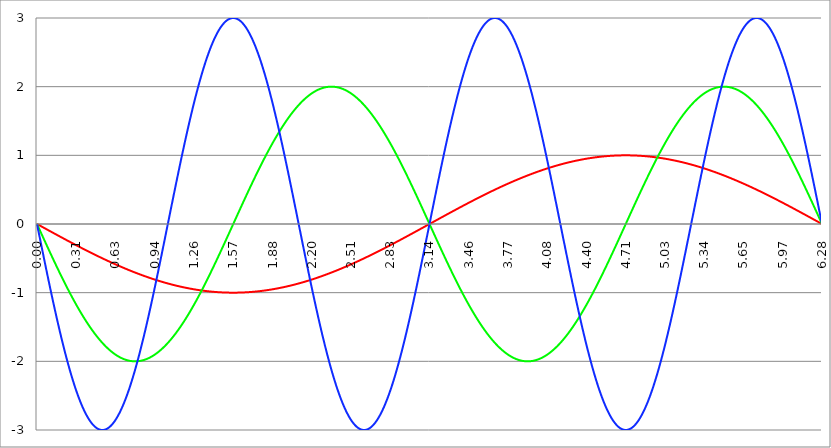
| Category | Series 1 | Series 0 | Series 2 |
|---|---|---|---|
| 0.0 | 0 | 0 | 0 |
| 0.00314159265358979 | -0.003 | -0.013 | -0.028 |
| 0.00628318530717958 | -0.006 | -0.025 | -0.057 |
| 0.00942477796076938 | -0.009 | -0.038 | -0.085 |
| 0.0125663706143592 | -0.013 | -0.05 | -0.113 |
| 0.015707963267949 | -0.016 | -0.063 | -0.141 |
| 0.0188495559215388 | -0.019 | -0.075 | -0.17 |
| 0.0219911485751285 | -0.022 | -0.088 | -0.198 |
| 0.0251327412287183 | -0.025 | -0.1 | -0.226 |
| 0.0282743338823081 | -0.028 | -0.113 | -0.254 |
| 0.0314159265358979 | -0.031 | -0.126 | -0.282 |
| 0.0345575191894877 | -0.035 | -0.138 | -0.31 |
| 0.0376991118430775 | -0.038 | -0.151 | -0.339 |
| 0.0408407044966673 | -0.041 | -0.163 | -0.367 |
| 0.0439822971502571 | -0.044 | -0.176 | -0.395 |
| 0.0471238898038469 | -0.047 | -0.188 | -0.423 |
| 0.0502654824574367 | -0.05 | -0.201 | -0.451 |
| 0.0534070751110265 | -0.053 | -0.213 | -0.479 |
| 0.0565486677646163 | -0.057 | -0.226 | -0.507 |
| 0.059690260418206 | -0.06 | -0.238 | -0.534 |
| 0.0628318530717958 | -0.063 | -0.251 | -0.562 |
| 0.0659734457253856 | -0.066 | -0.263 | -0.59 |
| 0.0691150383789754 | -0.069 | -0.276 | -0.618 |
| 0.0722566310325652 | -0.072 | -0.288 | -0.645 |
| 0.075398223686155 | -0.075 | -0.3 | -0.673 |
| 0.0785398163397448 | -0.078 | -0.313 | -0.7 |
| 0.0816814089933346 | -0.082 | -0.325 | -0.728 |
| 0.0848230016469244 | -0.085 | -0.338 | -0.755 |
| 0.0879645943005142 | -0.088 | -0.35 | -0.783 |
| 0.091106186954104 | -0.091 | -0.362 | -0.81 |
| 0.0942477796076937 | -0.094 | -0.375 | -0.837 |
| 0.0973893722612835 | -0.097 | -0.387 | -0.864 |
| 0.100530964914873 | -0.1 | -0.399 | -0.891 |
| 0.103672557568463 | -0.103 | -0.412 | -0.918 |
| 0.106814150222053 | -0.107 | -0.424 | -0.945 |
| 0.109955742875643 | -0.11 | -0.436 | -0.972 |
| 0.113097335529233 | -0.113 | -0.449 | -0.998 |
| 0.116238928182822 | -0.116 | -0.461 | -1.025 |
| 0.119380520836412 | -0.119 | -0.473 | -1.052 |
| 0.122522113490002 | -0.122 | -0.485 | -1.078 |
| 0.125663706143592 | -0.125 | -0.497 | -1.104 |
| 0.128805298797181 | -0.128 | -0.51 | -1.131 |
| 0.131946891450771 | -0.132 | -0.522 | -1.157 |
| 0.135088484104361 | -0.135 | -0.534 | -1.183 |
| 0.138230076757951 | -0.138 | -0.546 | -1.209 |
| 0.141371669411541 | -0.141 | -0.558 | -1.235 |
| 0.14451326206513 | -0.144 | -0.57 | -1.26 |
| 0.14765485471872 | -0.147 | -0.582 | -1.286 |
| 0.15079644737231 | -0.15 | -0.594 | -1.311 |
| 0.1539380400259 | -0.153 | -0.606 | -1.337 |
| 0.15707963267949 | -0.156 | -0.618 | -1.362 |
| 0.160221225333079 | -0.16 | -0.63 | -1.387 |
| 0.163362817986669 | -0.163 | -0.642 | -1.412 |
| 0.166504410640259 | -0.166 | -0.654 | -1.437 |
| 0.169646003293849 | -0.169 | -0.666 | -1.462 |
| 0.172787595947439 | -0.172 | -0.677 | -1.486 |
| 0.175929188601028 | -0.175 | -0.689 | -1.511 |
| 0.179070781254618 | -0.178 | -0.701 | -1.535 |
| 0.182212373908208 | -0.181 | -0.713 | -1.559 |
| 0.185353966561798 | -0.184 | -0.725 | -1.584 |
| 0.188495559215388 | -0.187 | -0.736 | -1.607 |
| 0.191637151868977 | -0.19 | -0.748 | -1.631 |
| 0.194778744522567 | -0.194 | -0.76 | -1.655 |
| 0.197920337176157 | -0.197 | -0.771 | -1.678 |
| 0.201061929829747 | -0.2 | -0.783 | -1.702 |
| 0.204203522483336 | -0.203 | -0.794 | -1.725 |
| 0.207345115136926 | -0.206 | -0.806 | -1.748 |
| 0.210486707790516 | -0.209 | -0.817 | -1.771 |
| 0.213628300444106 | -0.212 | -0.829 | -1.794 |
| 0.216769893097696 | -0.215 | -0.84 | -1.816 |
| 0.219911485751285 | -0.218 | -0.852 | -1.839 |
| 0.223053078404875 | -0.221 | -0.863 | -1.861 |
| 0.226194671058465 | -0.224 | -0.874 | -1.883 |
| 0.229336263712055 | -0.227 | -0.886 | -1.905 |
| 0.232477856365645 | -0.23 | -0.897 | -1.927 |
| 0.235619449019234 | -0.233 | -0.908 | -1.948 |
| 0.238761041672824 | -0.236 | -0.919 | -1.97 |
| 0.241902634326414 | -0.24 | -0.93 | -1.991 |
| 0.245044226980004 | -0.243 | -0.941 | -2.012 |
| 0.248185819633594 | -0.246 | -0.952 | -2.033 |
| 0.251327412287183 | -0.249 | -0.964 | -2.054 |
| 0.254469004940773 | -0.252 | -0.975 | -2.074 |
| 0.257610597594363 | -0.255 | -0.985 | -2.094 |
| 0.260752190247953 | -0.258 | -0.996 | -2.115 |
| 0.263893782901543 | -0.261 | -1.007 | -2.135 |
| 0.267035375555132 | -0.264 | -1.018 | -2.154 |
| 0.270176968208722 | -0.267 | -1.029 | -2.174 |
| 0.273318560862312 | -0.27 | -1.04 | -2.193 |
| 0.276460153515902 | -0.273 | -1.05 | -2.213 |
| 0.279601746169492 | -0.276 | -1.061 | -2.232 |
| 0.282743338823082 | -0.279 | -1.072 | -2.25 |
| 0.285884931476671 | -0.282 | -1.082 | -2.269 |
| 0.289026524130261 | -0.285 | -1.093 | -2.287 |
| 0.292168116783851 | -0.288 | -1.103 | -2.306 |
| 0.295309709437441 | -0.291 | -1.114 | -2.324 |
| 0.298451302091031 | -0.294 | -1.124 | -2.341 |
| 0.30159289474462 | -0.297 | -1.135 | -2.359 |
| 0.30473448739821 | -0.3 | -1.145 | -2.376 |
| 0.3078760800518 | -0.303 | -1.155 | -2.393 |
| 0.31101767270539 | -0.306 | -1.165 | -2.41 |
| 0.31415926535898 | -0.309 | -1.176 | -2.427 |
| 0.31730085801257 | -0.312 | -1.186 | -2.444 |
| 0.320442450666159 | -0.315 | -1.196 | -2.46 |
| 0.323584043319749 | -0.318 | -1.206 | -2.476 |
| 0.326725635973339 | -0.321 | -1.216 | -2.492 |
| 0.329867228626929 | -0.324 | -1.226 | -2.507 |
| 0.333008821280519 | -0.327 | -1.236 | -2.523 |
| 0.336150413934108 | -0.33 | -1.246 | -2.538 |
| 0.339292006587698 | -0.333 | -1.255 | -2.553 |
| 0.342433599241288 | -0.336 | -1.265 | -2.568 |
| 0.345575191894878 | -0.339 | -1.275 | -2.582 |
| 0.348716784548468 | -0.342 | -1.285 | -2.597 |
| 0.351858377202058 | -0.345 | -1.294 | -2.611 |
| 0.354999969855647 | -0.348 | -1.304 | -2.624 |
| 0.358141562509237 | -0.351 | -1.313 | -2.638 |
| 0.361283155162827 | -0.353 | -1.323 | -2.651 |
| 0.364424747816417 | -0.356 | -1.332 | -2.664 |
| 0.367566340470007 | -0.359 | -1.341 | -2.677 |
| 0.370707933123597 | -0.362 | -1.351 | -2.69 |
| 0.373849525777186 | -0.365 | -1.36 | -2.702 |
| 0.376991118430776 | -0.368 | -1.369 | -2.714 |
| 0.380132711084366 | -0.371 | -1.378 | -2.726 |
| 0.383274303737956 | -0.374 | -1.387 | -2.738 |
| 0.386415896391546 | -0.377 | -1.396 | -2.75 |
| 0.389557489045135 | -0.38 | -1.405 | -2.761 |
| 0.392699081698725 | -0.383 | -1.414 | -2.772 |
| 0.395840674352315 | -0.386 | -1.423 | -2.782 |
| 0.398982267005905 | -0.388 | -1.432 | -2.793 |
| 0.402123859659495 | -0.391 | -1.441 | -2.803 |
| 0.405265452313085 | -0.394 | -1.449 | -2.813 |
| 0.408407044966674 | -0.397 | -1.458 | -2.823 |
| 0.411548637620264 | -0.4 | -1.467 | -2.832 |
| 0.414690230273854 | -0.403 | -1.475 | -2.841 |
| 0.417831822927444 | -0.406 | -1.483 | -2.85 |
| 0.420973415581034 | -0.409 | -1.492 | -2.859 |
| 0.424115008234623 | -0.412 | -1.5 | -2.867 |
| 0.427256600888213 | -0.414 | -1.509 | -2.876 |
| 0.430398193541803 | -0.417 | -1.517 | -2.883 |
| 0.433539786195393 | -0.42 | -1.525 | -2.891 |
| 0.436681378848983 | -0.423 | -1.533 | -2.899 |
| 0.439822971502573 | -0.426 | -1.541 | -2.906 |
| 0.442964564156162 | -0.429 | -1.549 | -2.913 |
| 0.446106156809752 | -0.431 | -1.557 | -2.919 |
| 0.449247749463342 | -0.434 | -1.565 | -2.926 |
| 0.452389342116932 | -0.437 | -1.573 | -2.932 |
| 0.455530934770522 | -0.44 | -1.58 | -2.938 |
| 0.458672527424111 | -0.443 | -1.588 | -2.943 |
| 0.461814120077701 | -0.446 | -1.596 | -2.949 |
| 0.464955712731291 | -0.448 | -1.603 | -2.954 |
| 0.468097305384881 | -0.451 | -1.611 | -2.959 |
| 0.471238898038471 | -0.454 | -1.618 | -2.963 |
| 0.474380490692061 | -0.457 | -1.625 | -2.967 |
| 0.47752208334565 | -0.46 | -1.633 | -2.971 |
| 0.48066367599924 | -0.462 | -1.64 | -2.975 |
| 0.48380526865283 | -0.465 | -1.647 | -2.979 |
| 0.48694686130642 | -0.468 | -1.654 | -2.982 |
| 0.49008845396001 | -0.471 | -1.661 | -2.985 |
| 0.493230046613599 | -0.473 | -1.668 | -2.988 |
| 0.496371639267189 | -0.476 | -1.675 | -2.99 |
| 0.499513231920779 | -0.479 | -1.682 | -2.992 |
| 0.502654824574369 | -0.482 | -1.689 | -2.994 |
| 0.505796417227959 | -0.485 | -1.695 | -2.996 |
| 0.508938009881549 | -0.487 | -1.702 | -2.997 |
| 0.512079602535138 | -0.49 | -1.709 | -2.998 |
| 0.515221195188728 | -0.493 | -1.715 | -2.999 |
| 0.518362787842318 | -0.495 | -1.721 | -3 |
| 0.521504380495908 | -0.498 | -1.728 | -3 |
| 0.524645973149498 | -0.501 | -1.734 | -3 |
| 0.527787565803087 | -0.504 | -1.74 | -3 |
| 0.530929158456677 | -0.506 | -1.747 | -2.999 |
| 0.534070751110267 | -0.509 | -1.753 | -2.999 |
| 0.537212343763857 | -0.512 | -1.759 | -2.997 |
| 0.540353936417447 | -0.514 | -1.765 | -2.996 |
| 0.543495529071037 | -0.517 | -1.77 | -2.995 |
| 0.546637121724626 | -0.52 | -1.776 | -2.993 |
| 0.549778714378216 | -0.522 | -1.782 | -2.991 |
| 0.552920307031806 | -0.525 | -1.788 | -2.988 |
| 0.556061899685396 | -0.528 | -1.793 | -2.986 |
| 0.559203492338986 | -0.531 | -1.799 | -2.983 |
| 0.562345084992576 | -0.533 | -1.804 | -2.98 |
| 0.565486677646165 | -0.536 | -1.81 | -2.976 |
| 0.568628270299755 | -0.538 | -1.815 | -2.973 |
| 0.571769862953345 | -0.541 | -1.82 | -2.969 |
| 0.574911455606935 | -0.544 | -1.825 | -2.965 |
| 0.578053048260525 | -0.546 | -1.83 | -2.96 |
| 0.581194640914114 | -0.549 | -1.836 | -2.955 |
| 0.584336233567704 | -0.552 | -1.84 | -2.95 |
| 0.587477826221294 | -0.554 | -1.845 | -2.945 |
| 0.590619418874884 | -0.557 | -1.85 | -2.94 |
| 0.593761011528474 | -0.559 | -1.855 | -2.934 |
| 0.596902604182064 | -0.562 | -1.86 | -2.928 |
| 0.600044196835653 | -0.565 | -1.864 | -2.921 |
| 0.603185789489243 | -0.567 | -1.869 | -2.915 |
| 0.606327382142833 | -0.57 | -1.873 | -2.908 |
| 0.609468974796423 | -0.572 | -1.877 | -2.901 |
| 0.612610567450013 | -0.575 | -1.882 | -2.894 |
| 0.615752160103602 | -0.578 | -1.886 | -2.886 |
| 0.618893752757192 | -0.58 | -1.89 | -2.878 |
| 0.622035345410782 | -0.583 | -1.894 | -2.87 |
| 0.625176938064372 | -0.585 | -1.898 | -2.862 |
| 0.628318530717962 | -0.588 | -1.902 | -2.853 |
| 0.631460123371551 | -0.59 | -1.906 | -2.844 |
| 0.634601716025141 | -0.593 | -1.91 | -2.835 |
| 0.637743308678731 | -0.595 | -1.913 | -2.826 |
| 0.640884901332321 | -0.598 | -1.917 | -2.816 |
| 0.644026493985911 | -0.6 | -1.921 | -2.806 |
| 0.647168086639501 | -0.603 | -1.924 | -2.796 |
| 0.65030967929309 | -0.605 | -1.927 | -2.786 |
| 0.65345127194668 | -0.608 | -1.931 | -2.775 |
| 0.65659286460027 | -0.61 | -1.934 | -2.764 |
| 0.65973445725386 | -0.613 | -1.937 | -2.753 |
| 0.66287604990745 | -0.615 | -1.94 | -2.742 |
| 0.666017642561039 | -0.618 | -1.943 | -2.73 |
| 0.669159235214629 | -0.62 | -1.946 | -2.718 |
| 0.672300827868219 | -0.623 | -1.949 | -2.706 |
| 0.675442420521809 | -0.625 | -1.952 | -2.694 |
| 0.678584013175399 | -0.628 | -1.955 | -2.682 |
| 0.681725605828989 | -0.63 | -1.957 | -2.669 |
| 0.684867198482578 | -0.633 | -1.96 | -2.656 |
| 0.688008791136168 | -0.635 | -1.962 | -2.642 |
| 0.691150383789758 | -0.637 | -1.965 | -2.629 |
| 0.694291976443348 | -0.64 | -1.967 | -2.615 |
| 0.697433569096938 | -0.642 | -1.969 | -2.601 |
| 0.700575161750528 | -0.645 | -1.971 | -2.587 |
| 0.703716754404117 | -0.647 | -1.973 | -2.573 |
| 0.706858347057707 | -0.649 | -1.975 | -2.558 |
| 0.709999939711297 | -0.652 | -1.977 | -2.543 |
| 0.713141532364887 | -0.654 | -1.979 | -2.528 |
| 0.716283125018477 | -0.657 | -1.981 | -2.513 |
| 0.719424717672066 | -0.659 | -1.983 | -2.497 |
| 0.722566310325656 | -0.661 | -1.984 | -2.481 |
| 0.725707902979246 | -0.664 | -1.986 | -2.465 |
| 0.728849495632836 | -0.666 | -1.987 | -2.449 |
| 0.731991088286426 | -0.668 | -1.989 | -2.433 |
| 0.735132680940016 | -0.671 | -1.99 | -2.416 |
| 0.738274273593605 | -0.673 | -1.991 | -2.399 |
| 0.741415866247195 | -0.675 | -1.992 | -2.382 |
| 0.744557458900785 | -0.678 | -1.993 | -2.365 |
| 0.747699051554375 | -0.68 | -1.994 | -2.347 |
| 0.750840644207965 | -0.682 | -1.995 | -2.329 |
| 0.753982236861554 | -0.685 | -1.996 | -2.312 |
| 0.757123829515144 | -0.687 | -1.997 | -2.293 |
| 0.760265422168734 | -0.689 | -1.997 | -2.275 |
| 0.763407014822324 | -0.691 | -1.998 | -2.257 |
| 0.766548607475914 | -0.694 | -1.999 | -2.238 |
| 0.769690200129504 | -0.696 | -1.999 | -2.219 |
| 0.772831792783093 | -0.698 | -1.999 | -2.2 |
| 0.775973385436683 | -0.7 | -2 | -2.18 |
| 0.779114978090273 | -0.703 | -2 | -2.161 |
| 0.782256570743863 | -0.705 | -2 | -2.141 |
| 0.785398163397453 | -0.707 | -2 | -2.121 |
| 0.788539756051042 | -0.709 | -2 | -2.101 |
| 0.791681348704632 | -0.712 | -2 | -2.081 |
| 0.794822941358222 | -0.714 | -2 | -2.061 |
| 0.797964534011812 | -0.716 | -1.999 | -2.04 |
| 0.801106126665402 | -0.718 | -1.999 | -2.019 |
| 0.804247719318992 | -0.72 | -1.999 | -1.998 |
| 0.807389311972581 | -0.722 | -1.998 | -1.977 |
| 0.810530904626171 | -0.725 | -1.997 | -1.956 |
| 0.813672497279761 | -0.727 | -1.997 | -1.934 |
| 0.816814089933351 | -0.729 | -1.996 | -1.912 |
| 0.819955682586941 | -0.731 | -1.995 | -1.89 |
| 0.823097275240531 | -0.733 | -1.994 | -1.868 |
| 0.82623886789412 | -0.735 | -1.993 | -1.846 |
| 0.82938046054771 | -0.738 | -1.992 | -1.824 |
| 0.8325220532013 | -0.74 | -1.991 | -1.801 |
| 0.83566364585489 | -0.742 | -1.99 | -1.779 |
| 0.83880523850848 | -0.744 | -1.989 | -1.756 |
| 0.841946831162069 | -0.746 | -1.987 | -1.733 |
| 0.845088423815659 | -0.748 | -1.986 | -1.71 |
| 0.848230016469249 | -0.75 | -1.984 | -1.686 |
| 0.851371609122839 | -0.752 | -1.983 | -1.663 |
| 0.854513201776429 | -0.754 | -1.981 | -1.639 |
| 0.857654794430019 | -0.756 | -1.979 | -1.615 |
| 0.860796387083608 | -0.758 | -1.977 | -1.592 |
| 0.863937979737198 | -0.76 | -1.975 | -1.567 |
| 0.867079572390788 | -0.762 | -1.973 | -1.543 |
| 0.870221165044378 | -0.764 | -1.971 | -1.519 |
| 0.873362757697968 | -0.766 | -1.969 | -1.495 |
| 0.876504350351557 | -0.769 | -1.967 | -1.47 |
| 0.879645943005147 | -0.771 | -1.965 | -1.445 |
| 0.882787535658737 | -0.773 | -1.962 | -1.42 |
| 0.885929128312327 | -0.775 | -1.96 | -1.395 |
| 0.889070720965917 | -0.776 | -1.957 | -1.37 |
| 0.892212313619507 | -0.778 | -1.955 | -1.345 |
| 0.895353906273096 | -0.78 | -1.952 | -1.32 |
| 0.898495498926686 | -0.782 | -1.949 | -1.294 |
| 0.901637091580276 | -0.784 | -1.946 | -1.269 |
| 0.904778684233866 | -0.786 | -1.943 | -1.243 |
| 0.907920276887456 | -0.788 | -1.94 | -1.217 |
| 0.911061869541045 | -0.79 | -1.937 | -1.191 |
| 0.914203462194635 | -0.792 | -1.934 | -1.165 |
| 0.917345054848225 | -0.794 | -1.931 | -1.139 |
| 0.920486647501815 | -0.796 | -1.927 | -1.113 |
| 0.923628240155405 | -0.798 | -1.924 | -1.087 |
| 0.926769832808995 | -0.8 | -1.921 | -1.06 |
| 0.929911425462584 | -0.802 | -1.917 | -1.034 |
| 0.933053018116174 | -0.803 | -1.913 | -1.007 |
| 0.936194610769764 | -0.805 | -1.91 | -0.981 |
| 0.939336203423354 | -0.807 | -1.906 | -0.954 |
| 0.942477796076944 | -0.809 | -1.902 | -0.927 |
| 0.945619388730533 | -0.811 | -1.898 | -0.9 |
| 0.948760981384123 | -0.813 | -1.894 | -0.873 |
| 0.951902574037713 | -0.815 | -1.89 | -0.846 |
| 0.955044166691303 | -0.816 | -1.886 | -0.819 |
| 0.958185759344893 | -0.818 | -1.882 | -0.792 |
| 0.961327351998483 | -0.82 | -1.877 | -0.764 |
| 0.964468944652072 | -0.822 | -1.873 | -0.737 |
| 0.967610537305662 | -0.824 | -1.869 | -0.709 |
| 0.970752129959252 | -0.825 | -1.864 | -0.682 |
| 0.973893722612842 | -0.827 | -1.86 | -0.654 |
| 0.977035315266432 | -0.829 | -1.855 | -0.627 |
| 0.980176907920022 | -0.831 | -1.85 | -0.599 |
| 0.983318500573611 | -0.832 | -1.845 | -0.571 |
| 0.986460093227201 | -0.834 | -1.84 | -0.544 |
| 0.989601685880791 | -0.836 | -1.836 | -0.516 |
| 0.992743278534381 | -0.838 | -1.83 | -0.488 |
| 0.995884871187971 | -0.839 | -1.825 | -0.46 |
| 0.99902646384156 | -0.841 | -1.82 | -0.432 |
| 1.00216805649515 | -0.843 | -1.815 | -0.404 |
| 1.00530964914874 | -0.844 | -1.81 | -0.376 |
| 1.00845124180233 | -0.846 | -1.804 | -0.348 |
| 1.01159283445592 | -0.848 | -1.799 | -0.32 |
| 1.01473442710951 | -0.849 | -1.793 | -0.292 |
| 1.017876019763099 | -0.851 | -1.788 | -0.264 |
| 1.021017612416689 | -0.853 | -1.782 | -0.235 |
| 1.02415920507028 | -0.854 | -1.776 | -0.207 |
| 1.027300797723869 | -0.856 | -1.77 | -0.179 |
| 1.030442390377459 | -0.858 | -1.765 | -0.151 |
| 1.033583983031048 | -0.859 | -1.759 | -0.122 |
| 1.036725575684638 | -0.861 | -1.753 | -0.094 |
| 1.039867168338228 | -0.862 | -1.747 | -0.066 |
| 1.043008760991818 | -0.864 | -1.74 | -0.038 |
| 1.046150353645408 | -0.866 | -1.734 | -0.009 |
| 1.049291946298998 | -0.867 | -1.728 | 0.019 |
| 1.052433538952587 | -0.869 | -1.721 | 0.047 |
| 1.055575131606177 | -0.87 | -1.715 | 0.075 |
| 1.058716724259767 | -0.872 | -1.709 | 0.104 |
| 1.061858316913357 | -0.873 | -1.702 | 0.132 |
| 1.064999909566947 | -0.875 | -1.695 | 0.16 |
| 1.068141502220536 | -0.876 | -1.689 | 0.188 |
| 1.071283094874126 | -0.878 | -1.682 | 0.217 |
| 1.074424687527716 | -0.879 | -1.675 | 0.245 |
| 1.077566280181306 | -0.881 | -1.668 | 0.273 |
| 1.080707872834896 | -0.882 | -1.661 | 0.301 |
| 1.083849465488486 | -0.884 | -1.654 | 0.329 |
| 1.086991058142075 | -0.885 | -1.647 | 0.357 |
| 1.090132650795665 | -0.887 | -1.64 | 0.385 |
| 1.093274243449255 | -0.888 | -1.633 | 0.413 |
| 1.096415836102845 | -0.89 | -1.625 | 0.441 |
| 1.099557428756435 | -0.891 | -1.618 | 0.469 |
| 1.102699021410025 | -0.892 | -1.611 | 0.497 |
| 1.105840614063614 | -0.894 | -1.603 | 0.525 |
| 1.108982206717204 | -0.895 | -1.596 | 0.553 |
| 1.112123799370794 | -0.897 | -1.588 | 0.581 |
| 1.115265392024384 | -0.898 | -1.58 | 0.608 |
| 1.118406984677974 | -0.899 | -1.573 | 0.636 |
| 1.121548577331563 | -0.901 | -1.565 | 0.664 |
| 1.124690169985153 | -0.902 | -1.557 | 0.691 |
| 1.127831762638743 | -0.903 | -1.549 | 0.719 |
| 1.130973355292333 | -0.905 | -1.541 | 0.746 |
| 1.134114947945923 | -0.906 | -1.533 | 0.773 |
| 1.137256540599513 | -0.907 | -1.525 | 0.801 |
| 1.140398133253102 | -0.909 | -1.517 | 0.828 |
| 1.143539725906692 | -0.91 | -1.509 | 0.855 |
| 1.146681318560282 | -0.911 | -1.5 | 0.882 |
| 1.149822911213872 | -0.913 | -1.492 | 0.909 |
| 1.152964503867462 | -0.914 | -1.483 | 0.936 |
| 1.156106096521051 | -0.915 | -1.475 | 0.963 |
| 1.159247689174641 | -0.917 | -1.467 | 0.99 |
| 1.162389281828231 | -0.918 | -1.458 | 1.016 |
| 1.165530874481821 | -0.919 | -1.449 | 1.043 |
| 1.168672467135411 | -0.92 | -1.441 | 1.069 |
| 1.171814059789001 | -0.921 | -1.432 | 1.096 |
| 1.17495565244259 | -0.923 | -1.423 | 1.122 |
| 1.17809724509618 | -0.924 | -1.414 | 1.148 |
| 1.18123883774977 | -0.925 | -1.405 | 1.174 |
| 1.18438043040336 | -0.926 | -1.396 | 1.2 |
| 1.18752202305695 | -0.927 | -1.387 | 1.226 |
| 1.190663615710539 | -0.929 | -1.378 | 1.252 |
| 1.193805208364129 | -0.93 | -1.369 | 1.277 |
| 1.19694680101772 | -0.931 | -1.36 | 1.303 |
| 1.200088393671309 | -0.932 | -1.351 | 1.328 |
| 1.203229986324899 | -0.933 | -1.341 | 1.354 |
| 1.206371578978489 | -0.934 | -1.332 | 1.379 |
| 1.209513171632078 | -0.935 | -1.323 | 1.404 |
| 1.212654764285668 | -0.937 | -1.313 | 1.429 |
| 1.215796356939258 | -0.938 | -1.304 | 1.454 |
| 1.218937949592848 | -0.939 | -1.294 | 1.478 |
| 1.222079542246438 | -0.94 | -1.285 | 1.503 |
| 1.225221134900027 | -0.941 | -1.275 | 1.527 |
| 1.228362727553617 | -0.942 | -1.265 | 1.551 |
| 1.231504320207207 | -0.943 | -1.255 | 1.576 |
| 1.234645912860797 | -0.944 | -1.246 | 1.6 |
| 1.237787505514387 | -0.945 | -1.236 | 1.623 |
| 1.240929098167977 | -0.946 | -1.226 | 1.647 |
| 1.244070690821566 | -0.947 | -1.216 | 1.671 |
| 1.247212283475156 | -0.948 | -1.206 | 1.694 |
| 1.250353876128746 | -0.949 | -1.196 | 1.717 |
| 1.253495468782336 | -0.95 | -1.186 | 1.74 |
| 1.256637061435926 | -0.951 | -1.176 | 1.763 |
| 1.259778654089515 | -0.952 | -1.165 | 1.786 |
| 1.262920246743105 | -0.953 | -1.155 | 1.809 |
| 1.266061839396695 | -0.954 | -1.145 | 1.831 |
| 1.269203432050285 | -0.955 | -1.135 | 1.854 |
| 1.272345024703875 | -0.956 | -1.124 | 1.876 |
| 1.275486617357465 | -0.957 | -1.114 | 1.898 |
| 1.278628210011054 | -0.958 | -1.103 | 1.92 |
| 1.281769802664644 | -0.959 | -1.093 | 1.941 |
| 1.284911395318234 | -0.959 | -1.082 | 1.963 |
| 1.288052987971824 | -0.96 | -1.072 | 1.984 |
| 1.291194580625414 | -0.961 | -1.061 | 2.005 |
| 1.294336173279003 | -0.962 | -1.05 | 2.026 |
| 1.297477765932593 | -0.963 | -1.04 | 2.047 |
| 1.300619358586183 | -0.964 | -1.029 | 2.067 |
| 1.303760951239773 | -0.965 | -1.018 | 2.088 |
| 1.306902543893363 | -0.965 | -1.007 | 2.108 |
| 1.310044136546953 | -0.966 | -0.996 | 2.128 |
| 1.313185729200542 | -0.967 | -0.985 | 2.148 |
| 1.316327321854132 | -0.968 | -0.975 | 2.167 |
| 1.319468914507722 | -0.969 | -0.964 | 2.187 |
| 1.322610507161312 | -0.969 | -0.952 | 2.206 |
| 1.325752099814902 | -0.97 | -0.941 | 2.225 |
| 1.328893692468491 | -0.971 | -0.93 | 2.244 |
| 1.332035285122081 | -0.972 | -0.919 | 2.263 |
| 1.335176877775671 | -0.972 | -0.908 | 2.281 |
| 1.338318470429261 | -0.973 | -0.897 | 2.299 |
| 1.341460063082851 | -0.974 | -0.886 | 2.318 |
| 1.344601655736441 | -0.975 | -0.874 | 2.335 |
| 1.34774324839003 | -0.975 | -0.863 | 2.353 |
| 1.35088484104362 | -0.976 | -0.852 | 2.37 |
| 1.35402643369721 | -0.977 | -0.84 | 2.388 |
| 1.3571680263508 | -0.977 | -0.829 | 2.405 |
| 1.36030961900439 | -0.978 | -0.817 | 2.421 |
| 1.363451211657979 | -0.979 | -0.806 | 2.438 |
| 1.36659280431157 | -0.979 | -0.794 | 2.454 |
| 1.369734396965159 | -0.98 | -0.783 | 2.471 |
| 1.372875989618749 | -0.98 | -0.771 | 2.487 |
| 1.376017582272339 | -0.981 | -0.76 | 2.502 |
| 1.379159174925929 | -0.982 | -0.748 | 2.518 |
| 1.382300767579518 | -0.982 | -0.736 | 2.533 |
| 1.385442360233108 | -0.983 | -0.725 | 2.548 |
| 1.388583952886698 | -0.983 | -0.713 | 2.563 |
| 1.391725545540288 | -0.984 | -0.701 | 2.577 |
| 1.394867138193878 | -0.985 | -0.689 | 2.592 |
| 1.398008730847468 | -0.985 | -0.677 | 2.606 |
| 1.401150323501057 | -0.986 | -0.666 | 2.62 |
| 1.404291916154647 | -0.986 | -0.654 | 2.633 |
| 1.407433508808237 | -0.987 | -0.642 | 2.647 |
| 1.410575101461827 | -0.987 | -0.63 | 2.66 |
| 1.413716694115417 | -0.988 | -0.618 | 2.673 |
| 1.416858286769006 | -0.988 | -0.606 | 2.686 |
| 1.419999879422596 | -0.989 | -0.594 | 2.698 |
| 1.423141472076186 | -0.989 | -0.582 | 2.71 |
| 1.426283064729776 | -0.99 | -0.57 | 2.722 |
| 1.429424657383366 | -0.99 | -0.558 | 2.734 |
| 1.432566250036956 | -0.99 | -0.546 | 2.746 |
| 1.435707842690545 | -0.991 | -0.534 | 2.757 |
| 1.438849435344135 | -0.991 | -0.522 | 2.768 |
| 1.441991027997725 | -0.992 | -0.51 | 2.779 |
| 1.445132620651315 | -0.992 | -0.497 | 2.789 |
| 1.448274213304905 | -0.993 | -0.485 | 2.8 |
| 1.451415805958494 | -0.993 | -0.473 | 2.81 |
| 1.454557398612084 | -0.993 | -0.461 | 2.819 |
| 1.457698991265674 | -0.994 | -0.449 | 2.829 |
| 1.460840583919264 | -0.994 | -0.436 | 2.838 |
| 1.463982176572854 | -0.994 | -0.424 | 2.847 |
| 1.467123769226444 | -0.995 | -0.412 | 2.856 |
| 1.470265361880033 | -0.995 | -0.399 | 2.865 |
| 1.473406954533623 | -0.995 | -0.387 | 2.873 |
| 1.476548547187213 | -0.996 | -0.375 | 2.881 |
| 1.479690139840803 | -0.996 | -0.362 | 2.889 |
| 1.482831732494393 | -0.996 | -0.35 | 2.896 |
| 1.485973325147982 | -0.996 | -0.338 | 2.903 |
| 1.489114917801572 | -0.997 | -0.325 | 2.91 |
| 1.492256510455162 | -0.997 | -0.313 | 2.917 |
| 1.495398103108752 | -0.997 | -0.3 | 2.924 |
| 1.498539695762342 | -0.997 | -0.288 | 2.93 |
| 1.501681288415932 | -0.998 | -0.276 | 2.936 |
| 1.504822881069521 | -0.998 | -0.263 | 2.941 |
| 1.507964473723111 | -0.998 | -0.251 | 2.947 |
| 1.511106066376701 | -0.998 | -0.238 | 2.952 |
| 1.514247659030291 | -0.998 | -0.226 | 2.957 |
| 1.517389251683881 | -0.999 | -0.213 | 2.962 |
| 1.520530844337471 | -0.999 | -0.201 | 2.966 |
| 1.52367243699106 | -0.999 | -0.188 | 2.97 |
| 1.52681402964465 | -0.999 | -0.176 | 2.974 |
| 1.52995562229824 | -0.999 | -0.163 | 2.978 |
| 1.53309721495183 | -0.999 | -0.151 | 2.981 |
| 1.53623880760542 | -0.999 | -0.138 | 2.984 |
| 1.539380400259009 | -1 | -0.126 | 2.987 |
| 1.542521992912599 | -1 | -0.113 | 2.989 |
| 1.545663585566189 | -1 | -0.1 | 2.991 |
| 1.548805178219779 | -1 | -0.088 | 2.993 |
| 1.551946770873369 | -1 | -0.075 | 2.995 |
| 1.555088363526959 | -1 | -0.063 | 2.997 |
| 1.558229956180548 | -1 | -0.05 | 2.998 |
| 1.561371548834138 | -1 | -0.038 | 2.999 |
| 1.564513141487728 | -1 | -0.025 | 2.999 |
| 1.567654734141318 | -1 | -0.013 | 3 |
| 1.570796326794908 | -1 | 0 | 3 |
| 1.573937919448497 | -1 | 0.013 | 3 |
| 1.577079512102087 | -1 | 0.025 | 2.999 |
| 1.580221104755677 | -1 | 0.038 | 2.999 |
| 1.583362697409267 | -1 | 0.05 | 2.998 |
| 1.586504290062857 | -1 | 0.063 | 2.997 |
| 1.589645882716447 | -1 | 0.075 | 2.995 |
| 1.592787475370036 | -1 | 0.088 | 2.993 |
| 1.595929068023626 | -1 | 0.1 | 2.991 |
| 1.599070660677216 | -1 | 0.113 | 2.989 |
| 1.602212253330806 | -1 | 0.126 | 2.987 |
| 1.605353845984396 | -0.999 | 0.138 | 2.984 |
| 1.608495438637985 | -0.999 | 0.151 | 2.981 |
| 1.611637031291575 | -0.999 | 0.163 | 2.978 |
| 1.614778623945165 | -0.999 | 0.176 | 2.974 |
| 1.617920216598755 | -0.999 | 0.188 | 2.97 |
| 1.621061809252345 | -0.999 | 0.201 | 2.966 |
| 1.624203401905935 | -0.999 | 0.213 | 2.962 |
| 1.627344994559524 | -0.998 | 0.226 | 2.957 |
| 1.630486587213114 | -0.998 | 0.238 | 2.952 |
| 1.633628179866704 | -0.998 | 0.251 | 2.947 |
| 1.636769772520294 | -0.998 | 0.263 | 2.941 |
| 1.639911365173884 | -0.998 | 0.276 | 2.936 |
| 1.643052957827473 | -0.997 | 0.288 | 2.93 |
| 1.646194550481063 | -0.997 | 0.3 | 2.924 |
| 1.649336143134653 | -0.997 | 0.313 | 2.917 |
| 1.652477735788243 | -0.997 | 0.325 | 2.91 |
| 1.655619328441833 | -0.996 | 0.338 | 2.903 |
| 1.658760921095423 | -0.996 | 0.35 | 2.896 |
| 1.661902513749012 | -0.996 | 0.362 | 2.889 |
| 1.665044106402602 | -0.996 | 0.375 | 2.881 |
| 1.668185699056192 | -0.995 | 0.387 | 2.873 |
| 1.671327291709782 | -0.995 | 0.399 | 2.865 |
| 1.674468884363372 | -0.995 | 0.412 | 2.856 |
| 1.677610477016961 | -0.994 | 0.424 | 2.847 |
| 1.680752069670551 | -0.994 | 0.436 | 2.838 |
| 1.683893662324141 | -0.994 | 0.449 | 2.829 |
| 1.687035254977731 | -0.993 | 0.461 | 2.819 |
| 1.690176847631321 | -0.993 | 0.473 | 2.81 |
| 1.693318440284911 | -0.993 | 0.485 | 2.8 |
| 1.6964600329385 | -0.992 | 0.497 | 2.789 |
| 1.69960162559209 | -0.992 | 0.51 | 2.779 |
| 1.70274321824568 | -0.991 | 0.522 | 2.768 |
| 1.70588481089927 | -0.991 | 0.534 | 2.757 |
| 1.70902640355286 | -0.99 | 0.546 | 2.746 |
| 1.712167996206449 | -0.99 | 0.558 | 2.734 |
| 1.715309588860039 | -0.99 | 0.57 | 2.722 |
| 1.71845118151363 | -0.989 | 0.582 | 2.71 |
| 1.721592774167219 | -0.989 | 0.594 | 2.698 |
| 1.724734366820809 | -0.988 | 0.606 | 2.686 |
| 1.727875959474399 | -0.988 | 0.618 | 2.673 |
| 1.731017552127988 | -0.987 | 0.63 | 2.66 |
| 1.734159144781578 | -0.987 | 0.642 | 2.647 |
| 1.737300737435168 | -0.986 | 0.654 | 2.633 |
| 1.740442330088758 | -0.986 | 0.666 | 2.62 |
| 1.743583922742348 | -0.985 | 0.677 | 2.606 |
| 1.746725515395937 | -0.985 | 0.689 | 2.592 |
| 1.749867108049527 | -0.984 | 0.701 | 2.577 |
| 1.753008700703117 | -0.983 | 0.713 | 2.563 |
| 1.756150293356707 | -0.983 | 0.725 | 2.548 |
| 1.759291886010297 | -0.982 | 0.736 | 2.533 |
| 1.762433478663887 | -0.982 | 0.748 | 2.518 |
| 1.765575071317476 | -0.981 | 0.76 | 2.502 |
| 1.768716663971066 | -0.98 | 0.771 | 2.487 |
| 1.771858256624656 | -0.98 | 0.783 | 2.471 |
| 1.774999849278246 | -0.979 | 0.794 | 2.454 |
| 1.778141441931836 | -0.979 | 0.806 | 2.438 |
| 1.781283034585426 | -0.978 | 0.817 | 2.421 |
| 1.784424627239015 | -0.977 | 0.829 | 2.405 |
| 1.787566219892605 | -0.977 | 0.84 | 2.388 |
| 1.790707812546195 | -0.976 | 0.852 | 2.37 |
| 1.793849405199785 | -0.975 | 0.863 | 2.353 |
| 1.796990997853375 | -0.975 | 0.874 | 2.335 |
| 1.800132590506964 | -0.974 | 0.886 | 2.318 |
| 1.803274183160554 | -0.973 | 0.897 | 2.299 |
| 1.806415775814144 | -0.972 | 0.908 | 2.281 |
| 1.809557368467734 | -0.972 | 0.919 | 2.263 |
| 1.812698961121324 | -0.971 | 0.93 | 2.244 |
| 1.815840553774914 | -0.97 | 0.941 | 2.225 |
| 1.818982146428503 | -0.969 | 0.952 | 2.206 |
| 1.822123739082093 | -0.969 | 0.964 | 2.187 |
| 1.825265331735683 | -0.968 | 0.975 | 2.167 |
| 1.828406924389273 | -0.967 | 0.985 | 2.148 |
| 1.831548517042863 | -0.966 | 0.996 | 2.128 |
| 1.834690109696452 | -0.965 | 1.007 | 2.108 |
| 1.837831702350042 | -0.965 | 1.018 | 2.088 |
| 1.840973295003632 | -0.964 | 1.029 | 2.067 |
| 1.844114887657222 | -0.963 | 1.04 | 2.047 |
| 1.847256480310812 | -0.962 | 1.05 | 2.026 |
| 1.850398072964402 | -0.961 | 1.061 | 2.005 |
| 1.853539665617991 | -0.96 | 1.072 | 1.984 |
| 1.856681258271581 | -0.959 | 1.082 | 1.963 |
| 1.859822850925171 | -0.959 | 1.093 | 1.941 |
| 1.862964443578761 | -0.958 | 1.103 | 1.92 |
| 1.866106036232351 | -0.957 | 1.114 | 1.898 |
| 1.86924762888594 | -0.956 | 1.124 | 1.876 |
| 1.87238922153953 | -0.955 | 1.135 | 1.854 |
| 1.87553081419312 | -0.954 | 1.145 | 1.831 |
| 1.87867240684671 | -0.953 | 1.155 | 1.809 |
| 1.8818139995003 | -0.952 | 1.165 | 1.786 |
| 1.88495559215389 | -0.951 | 1.176 | 1.763 |
| 1.888097184807479 | -0.95 | 1.186 | 1.74 |
| 1.891238777461069 | -0.949 | 1.196 | 1.717 |
| 1.89438037011466 | -0.948 | 1.206 | 1.694 |
| 1.897521962768249 | -0.947 | 1.216 | 1.671 |
| 1.900663555421839 | -0.946 | 1.226 | 1.647 |
| 1.903805148075429 | -0.945 | 1.236 | 1.623 |
| 1.906946740729018 | -0.944 | 1.246 | 1.6 |
| 1.910088333382608 | -0.943 | 1.255 | 1.576 |
| 1.913229926036198 | -0.942 | 1.265 | 1.551 |
| 1.916371518689788 | -0.941 | 1.275 | 1.527 |
| 1.919513111343378 | -0.94 | 1.285 | 1.503 |
| 1.922654703996967 | -0.939 | 1.294 | 1.478 |
| 1.925796296650557 | -0.938 | 1.304 | 1.454 |
| 1.928937889304147 | -0.937 | 1.313 | 1.429 |
| 1.932079481957737 | -0.935 | 1.323 | 1.404 |
| 1.935221074611327 | -0.934 | 1.332 | 1.379 |
| 1.938362667264917 | -0.933 | 1.341 | 1.354 |
| 1.941504259918506 | -0.932 | 1.351 | 1.328 |
| 1.944645852572096 | -0.931 | 1.36 | 1.303 |
| 1.947787445225686 | -0.93 | 1.369 | 1.277 |
| 1.950929037879276 | -0.929 | 1.378 | 1.252 |
| 1.954070630532866 | -0.927 | 1.387 | 1.226 |
| 1.957212223186455 | -0.926 | 1.396 | 1.2 |
| 1.960353815840045 | -0.925 | 1.405 | 1.174 |
| 1.963495408493635 | -0.924 | 1.414 | 1.148 |
| 1.966637001147225 | -0.923 | 1.423 | 1.122 |
| 1.969778593800815 | -0.921 | 1.432 | 1.096 |
| 1.972920186454405 | -0.92 | 1.441 | 1.069 |
| 1.976061779107994 | -0.919 | 1.449 | 1.043 |
| 1.979203371761584 | -0.918 | 1.458 | 1.016 |
| 1.982344964415174 | -0.917 | 1.467 | 0.99 |
| 1.985486557068764 | -0.915 | 1.475 | 0.963 |
| 1.988628149722354 | -0.914 | 1.483 | 0.936 |
| 1.991769742375943 | -0.913 | 1.492 | 0.909 |
| 1.994911335029533 | -0.911 | 1.5 | 0.882 |
| 1.998052927683123 | -0.91 | 1.509 | 0.855 |
| 2.001194520336712 | -0.909 | 1.517 | 0.828 |
| 2.004336112990302 | -0.907 | 1.525 | 0.801 |
| 2.007477705643892 | -0.906 | 1.533 | 0.773 |
| 2.010619298297482 | -0.905 | 1.541 | 0.746 |
| 2.013760890951071 | -0.903 | 1.549 | 0.719 |
| 2.016902483604661 | -0.902 | 1.557 | 0.691 |
| 2.02004407625825 | -0.901 | 1.565 | 0.664 |
| 2.02318566891184 | -0.899 | 1.573 | 0.636 |
| 2.02632726156543 | -0.898 | 1.58 | 0.608 |
| 2.029468854219019 | -0.897 | 1.588 | 0.581 |
| 2.032610446872609 | -0.895 | 1.596 | 0.553 |
| 2.035752039526198 | -0.894 | 1.603 | 0.525 |
| 2.038893632179788 | -0.892 | 1.611 | 0.497 |
| 2.042035224833378 | -0.891 | 1.618 | 0.469 |
| 2.045176817486967 | -0.89 | 1.625 | 0.441 |
| 2.048318410140557 | -0.888 | 1.633 | 0.413 |
| 2.051460002794146 | -0.887 | 1.64 | 0.385 |
| 2.054601595447736 | -0.885 | 1.647 | 0.357 |
| 2.057743188101325 | -0.884 | 1.654 | 0.329 |
| 2.060884780754915 | -0.882 | 1.661 | 0.301 |
| 2.064026373408505 | -0.881 | 1.668 | 0.273 |
| 2.067167966062094 | -0.879 | 1.675 | 0.245 |
| 2.070309558715684 | -0.878 | 1.682 | 0.217 |
| 2.073451151369273 | -0.876 | 1.689 | 0.188 |
| 2.076592744022863 | -0.875 | 1.695 | 0.16 |
| 2.079734336676452 | -0.873 | 1.702 | 0.132 |
| 2.082875929330042 | -0.872 | 1.709 | 0.104 |
| 2.086017521983632 | -0.87 | 1.715 | 0.075 |
| 2.089159114637221 | -0.869 | 1.721 | 0.047 |
| 2.092300707290811 | -0.867 | 1.728 | 0.019 |
| 2.095442299944401 | -0.866 | 1.734 | -0.009 |
| 2.09858389259799 | -0.864 | 1.74 | -0.038 |
| 2.10172548525158 | -0.862 | 1.747 | -0.066 |
| 2.104867077905169 | -0.861 | 1.753 | -0.094 |
| 2.108008670558759 | -0.859 | 1.759 | -0.122 |
| 2.111150263212349 | -0.858 | 1.765 | -0.151 |
| 2.114291855865938 | -0.856 | 1.77 | -0.179 |
| 2.117433448519528 | -0.854 | 1.776 | -0.207 |
| 2.120575041173117 | -0.853 | 1.782 | -0.235 |
| 2.123716633826707 | -0.851 | 1.788 | -0.264 |
| 2.126858226480297 | -0.849 | 1.793 | -0.292 |
| 2.129999819133886 | -0.848 | 1.799 | -0.32 |
| 2.133141411787476 | -0.846 | 1.804 | -0.348 |
| 2.136283004441065 | -0.844 | 1.81 | -0.376 |
| 2.139424597094655 | -0.843 | 1.815 | -0.404 |
| 2.142566189748245 | -0.841 | 1.82 | -0.432 |
| 2.145707782401834 | -0.839 | 1.825 | -0.46 |
| 2.148849375055424 | -0.838 | 1.83 | -0.488 |
| 2.151990967709013 | -0.836 | 1.836 | -0.516 |
| 2.155132560362603 | -0.834 | 1.84 | -0.544 |
| 2.158274153016193 | -0.832 | 1.845 | -0.571 |
| 2.161415745669782 | -0.831 | 1.85 | -0.599 |
| 2.164557338323372 | -0.829 | 1.855 | -0.627 |
| 2.167698930976961 | -0.827 | 1.86 | -0.654 |
| 2.170840523630551 | -0.825 | 1.864 | -0.682 |
| 2.173982116284141 | -0.824 | 1.869 | -0.709 |
| 2.17712370893773 | -0.822 | 1.873 | -0.737 |
| 2.18026530159132 | -0.82 | 1.877 | -0.764 |
| 2.183406894244909 | -0.818 | 1.882 | -0.792 |
| 2.186548486898499 | -0.816 | 1.886 | -0.819 |
| 2.189690079552089 | -0.815 | 1.89 | -0.846 |
| 2.192831672205678 | -0.813 | 1.894 | -0.873 |
| 2.195973264859268 | -0.811 | 1.898 | -0.9 |
| 2.199114857512857 | -0.809 | 1.902 | -0.927 |
| 2.202256450166447 | -0.807 | 1.906 | -0.954 |
| 2.205398042820036 | -0.805 | 1.91 | -0.981 |
| 2.208539635473626 | -0.803 | 1.913 | -1.007 |
| 2.211681228127216 | -0.802 | 1.917 | -1.034 |
| 2.214822820780805 | -0.8 | 1.921 | -1.06 |
| 2.217964413434395 | -0.798 | 1.924 | -1.087 |
| 2.221106006087984 | -0.796 | 1.927 | -1.113 |
| 2.224247598741574 | -0.794 | 1.931 | -1.139 |
| 2.227389191395164 | -0.792 | 1.934 | -1.165 |
| 2.230530784048753 | -0.79 | 1.937 | -1.191 |
| 2.233672376702343 | -0.788 | 1.94 | -1.217 |
| 2.236813969355933 | -0.786 | 1.943 | -1.243 |
| 2.239955562009522 | -0.784 | 1.946 | -1.269 |
| 2.243097154663112 | -0.782 | 1.949 | -1.294 |
| 2.246238747316701 | -0.78 | 1.952 | -1.32 |
| 2.249380339970291 | -0.778 | 1.955 | -1.345 |
| 2.252521932623881 | -0.776 | 1.957 | -1.37 |
| 2.25566352527747 | -0.775 | 1.96 | -1.395 |
| 2.25880511793106 | -0.773 | 1.962 | -1.42 |
| 2.261946710584649 | -0.771 | 1.965 | -1.445 |
| 2.265088303238239 | -0.769 | 1.967 | -1.47 |
| 2.268229895891829 | -0.766 | 1.969 | -1.495 |
| 2.271371488545418 | -0.764 | 1.971 | -1.519 |
| 2.274513081199008 | -0.762 | 1.973 | -1.543 |
| 2.277654673852597 | -0.76 | 1.975 | -1.567 |
| 2.280796266506186 | -0.758 | 1.977 | -1.592 |
| 2.283937859159776 | -0.756 | 1.979 | -1.615 |
| 2.287079451813366 | -0.754 | 1.981 | -1.639 |
| 2.290221044466955 | -0.752 | 1.983 | -1.663 |
| 2.293362637120545 | -0.75 | 1.984 | -1.686 |
| 2.296504229774135 | -0.748 | 1.986 | -1.71 |
| 2.299645822427724 | -0.746 | 1.987 | -1.733 |
| 2.302787415081314 | -0.744 | 1.989 | -1.756 |
| 2.305929007734904 | -0.742 | 1.99 | -1.779 |
| 2.309070600388493 | -0.74 | 1.991 | -1.801 |
| 2.312212193042083 | -0.738 | 1.992 | -1.824 |
| 2.315353785695672 | -0.735 | 1.993 | -1.846 |
| 2.318495378349262 | -0.733 | 1.994 | -1.868 |
| 2.321636971002852 | -0.731 | 1.995 | -1.89 |
| 2.324778563656441 | -0.729 | 1.996 | -1.912 |
| 2.327920156310031 | -0.727 | 1.997 | -1.934 |
| 2.33106174896362 | -0.725 | 1.997 | -1.956 |
| 2.33420334161721 | -0.722 | 1.998 | -1.977 |
| 2.3373449342708 | -0.72 | 1.999 | -1.998 |
| 2.340486526924389 | -0.718 | 1.999 | -2.019 |
| 2.343628119577979 | -0.716 | 1.999 | -2.04 |
| 2.346769712231568 | -0.714 | 2 | -2.061 |
| 2.349911304885158 | -0.712 | 2 | -2.081 |
| 2.353052897538748 | -0.709 | 2 | -2.101 |
| 2.356194490192337 | -0.707 | 2 | -2.121 |
| 2.359336082845927 | -0.705 | 2 | -2.141 |
| 2.362477675499516 | -0.703 | 2 | -2.161 |
| 2.365619268153106 | -0.7 | 2 | -2.18 |
| 2.368760860806696 | -0.698 | 1.999 | -2.2 |
| 2.371902453460285 | -0.696 | 1.999 | -2.219 |
| 2.375044046113875 | -0.694 | 1.999 | -2.238 |
| 2.378185638767464 | -0.691 | 1.998 | -2.257 |
| 2.381327231421054 | -0.689 | 1.997 | -2.275 |
| 2.384468824074644 | -0.687 | 1.997 | -2.293 |
| 2.387610416728233 | -0.685 | 1.996 | -2.312 |
| 2.390752009381823 | -0.682 | 1.995 | -2.329 |
| 2.393893602035412 | -0.68 | 1.994 | -2.347 |
| 2.397035194689002 | -0.678 | 1.993 | -2.365 |
| 2.400176787342591 | -0.675 | 1.992 | -2.382 |
| 2.403318379996181 | -0.673 | 1.991 | -2.399 |
| 2.406459972649771 | -0.671 | 1.99 | -2.416 |
| 2.40960156530336 | -0.668 | 1.989 | -2.433 |
| 2.41274315795695 | -0.666 | 1.987 | -2.449 |
| 2.41588475061054 | -0.664 | 1.986 | -2.465 |
| 2.419026343264129 | -0.661 | 1.984 | -2.481 |
| 2.422167935917719 | -0.659 | 1.983 | -2.497 |
| 2.425309528571308 | -0.657 | 1.981 | -2.513 |
| 2.428451121224898 | -0.654 | 1.979 | -2.528 |
| 2.431592713878488 | -0.652 | 1.977 | -2.543 |
| 2.434734306532077 | -0.649 | 1.975 | -2.558 |
| 2.437875899185667 | -0.647 | 1.973 | -2.573 |
| 2.441017491839256 | -0.645 | 1.971 | -2.587 |
| 2.444159084492846 | -0.642 | 1.969 | -2.601 |
| 2.447300677146435 | -0.64 | 1.967 | -2.615 |
| 2.450442269800025 | -0.637 | 1.965 | -2.629 |
| 2.453583862453615 | -0.635 | 1.962 | -2.642 |
| 2.456725455107204 | -0.633 | 1.96 | -2.656 |
| 2.459867047760794 | -0.63 | 1.957 | -2.669 |
| 2.463008640414384 | -0.628 | 1.955 | -2.682 |
| 2.466150233067973 | -0.625 | 1.952 | -2.694 |
| 2.469291825721563 | -0.623 | 1.949 | -2.706 |
| 2.472433418375152 | -0.62 | 1.946 | -2.718 |
| 2.475575011028742 | -0.618 | 1.943 | -2.73 |
| 2.478716603682332 | -0.615 | 1.94 | -2.742 |
| 2.481858196335921 | -0.613 | 1.937 | -2.753 |
| 2.48499978898951 | -0.61 | 1.934 | -2.764 |
| 2.4881413816431 | -0.608 | 1.931 | -2.775 |
| 2.49128297429669 | -0.605 | 1.927 | -2.786 |
| 2.49442456695028 | -0.603 | 1.924 | -2.796 |
| 2.497566159603869 | -0.6 | 1.921 | -2.806 |
| 2.500707752257458 | -0.598 | 1.917 | -2.816 |
| 2.503849344911048 | -0.595 | 1.913 | -2.826 |
| 2.506990937564638 | -0.593 | 1.91 | -2.835 |
| 2.510132530218228 | -0.59 | 1.906 | -2.844 |
| 2.513274122871817 | -0.588 | 1.902 | -2.853 |
| 2.516415715525407 | -0.585 | 1.898 | -2.862 |
| 2.519557308178996 | -0.583 | 1.894 | -2.87 |
| 2.522698900832586 | -0.58 | 1.89 | -2.878 |
| 2.525840493486176 | -0.578 | 1.886 | -2.886 |
| 2.528982086139765 | -0.575 | 1.882 | -2.894 |
| 2.532123678793355 | -0.572 | 1.877 | -2.901 |
| 2.535265271446944 | -0.57 | 1.873 | -2.908 |
| 2.538406864100534 | -0.567 | 1.869 | -2.915 |
| 2.541548456754124 | -0.565 | 1.864 | -2.921 |
| 2.544690049407713 | -0.562 | 1.86 | -2.928 |
| 2.547831642061302 | -0.559 | 1.855 | -2.934 |
| 2.550973234714892 | -0.557 | 1.85 | -2.94 |
| 2.554114827368482 | -0.554 | 1.845 | -2.945 |
| 2.557256420022072 | -0.552 | 1.84 | -2.95 |
| 2.560398012675661 | -0.549 | 1.836 | -2.955 |
| 2.563539605329251 | -0.546 | 1.83 | -2.96 |
| 2.56668119798284 | -0.544 | 1.825 | -2.965 |
| 2.56982279063643 | -0.541 | 1.82 | -2.969 |
| 2.57296438329002 | -0.538 | 1.815 | -2.973 |
| 2.576105975943609 | -0.536 | 1.81 | -2.976 |
| 2.579247568597199 | -0.533 | 1.804 | -2.98 |
| 2.582389161250788 | -0.531 | 1.799 | -2.983 |
| 2.585530753904377 | -0.528 | 1.793 | -2.986 |
| 2.588672346557967 | -0.525 | 1.788 | -2.988 |
| 2.591813939211557 | -0.522 | 1.782 | -2.991 |
| 2.594955531865147 | -0.52 | 1.776 | -2.993 |
| 2.598097124518736 | -0.517 | 1.77 | -2.995 |
| 2.601238717172326 | -0.514 | 1.765 | -2.996 |
| 2.604380309825915 | -0.512 | 1.759 | -2.997 |
| 2.607521902479505 | -0.509 | 1.753 | -2.999 |
| 2.610663495133095 | -0.506 | 1.747 | -2.999 |
| 2.613805087786684 | -0.504 | 1.74 | -3 |
| 2.616946680440274 | -0.501 | 1.734 | -3 |
| 2.620088273093863 | -0.498 | 1.728 | -3 |
| 2.623229865747452 | -0.495 | 1.721 | -3 |
| 2.626371458401042 | -0.493 | 1.715 | -2.999 |
| 2.629513051054632 | -0.49 | 1.709 | -2.998 |
| 2.632654643708222 | -0.487 | 1.702 | -2.997 |
| 2.635796236361811 | -0.485 | 1.695 | -2.996 |
| 2.638937829015401 | -0.482 | 1.689 | -2.994 |
| 2.642079421668991 | -0.479 | 1.682 | -2.992 |
| 2.64522101432258 | -0.476 | 1.675 | -2.99 |
| 2.64836260697617 | -0.473 | 1.668 | -2.988 |
| 2.651504199629759 | -0.471 | 1.661 | -2.985 |
| 2.654645792283349 | -0.468 | 1.654 | -2.982 |
| 2.657787384936938 | -0.465 | 1.647 | -2.979 |
| 2.660928977590528 | -0.462 | 1.64 | -2.975 |
| 2.664070570244118 | -0.46 | 1.633 | -2.971 |
| 2.667212162897707 | -0.457 | 1.625 | -2.967 |
| 2.670353755551297 | -0.454 | 1.618 | -2.963 |
| 2.673495348204887 | -0.451 | 1.611 | -2.959 |
| 2.676636940858476 | -0.448 | 1.603 | -2.954 |
| 2.679778533512066 | -0.446 | 1.596 | -2.949 |
| 2.682920126165655 | -0.443 | 1.588 | -2.943 |
| 2.686061718819245 | -0.44 | 1.58 | -2.938 |
| 2.689203311472835 | -0.437 | 1.573 | -2.932 |
| 2.692344904126424 | -0.434 | 1.565 | -2.926 |
| 2.695486496780014 | -0.431 | 1.557 | -2.919 |
| 2.698628089433603 | -0.429 | 1.549 | -2.913 |
| 2.701769682087193 | -0.426 | 1.541 | -2.906 |
| 2.704911274740782 | -0.423 | 1.533 | -2.899 |
| 2.708052867394372 | -0.42 | 1.525 | -2.891 |
| 2.711194460047962 | -0.417 | 1.517 | -2.883 |
| 2.714336052701551 | -0.414 | 1.509 | -2.876 |
| 2.717477645355141 | -0.412 | 1.5 | -2.867 |
| 2.720619238008731 | -0.409 | 1.492 | -2.859 |
| 2.72376083066232 | -0.406 | 1.483 | -2.85 |
| 2.72690242331591 | -0.403 | 1.475 | -2.841 |
| 2.730044015969499 | -0.4 | 1.467 | -2.832 |
| 2.733185608623089 | -0.397 | 1.458 | -2.823 |
| 2.736327201276678 | -0.394 | 1.449 | -2.813 |
| 2.739468793930268 | -0.391 | 1.441 | -2.803 |
| 2.742610386583858 | -0.388 | 1.432 | -2.793 |
| 2.745751979237447 | -0.386 | 1.423 | -2.782 |
| 2.748893571891036 | -0.383 | 1.414 | -2.772 |
| 2.752035164544627 | -0.38 | 1.405 | -2.761 |
| 2.755176757198216 | -0.377 | 1.396 | -2.75 |
| 2.758318349851806 | -0.374 | 1.387 | -2.738 |
| 2.761459942505395 | -0.371 | 1.378 | -2.726 |
| 2.764601535158985 | -0.368 | 1.369 | -2.714 |
| 2.767743127812574 | -0.365 | 1.36 | -2.702 |
| 2.770884720466164 | -0.362 | 1.351 | -2.69 |
| 2.774026313119754 | -0.359 | 1.341 | -2.677 |
| 2.777167905773343 | -0.356 | 1.332 | -2.664 |
| 2.780309498426932 | -0.353 | 1.323 | -2.651 |
| 2.783451091080522 | -0.351 | 1.313 | -2.638 |
| 2.786592683734112 | -0.348 | 1.304 | -2.624 |
| 2.789734276387701 | -0.345 | 1.294 | -2.611 |
| 2.792875869041291 | -0.342 | 1.285 | -2.597 |
| 2.796017461694881 | -0.339 | 1.275 | -2.582 |
| 2.79915905434847 | -0.336 | 1.265 | -2.568 |
| 2.80230064700206 | -0.333 | 1.255 | -2.553 |
| 2.80544223965565 | -0.33 | 1.246 | -2.538 |
| 2.808583832309239 | -0.327 | 1.236 | -2.523 |
| 2.811725424962829 | -0.324 | 1.226 | -2.507 |
| 2.814867017616419 | -0.321 | 1.216 | -2.492 |
| 2.818008610270008 | -0.318 | 1.206 | -2.476 |
| 2.821150202923598 | -0.315 | 1.196 | -2.46 |
| 2.824291795577187 | -0.312 | 1.186 | -2.444 |
| 2.827433388230777 | -0.309 | 1.176 | -2.427 |
| 2.830574980884366 | -0.306 | 1.165 | -2.41 |
| 2.833716573537956 | -0.303 | 1.155 | -2.393 |
| 2.836858166191546 | -0.3 | 1.145 | -2.376 |
| 2.839999758845135 | -0.297 | 1.135 | -2.359 |
| 2.843141351498725 | -0.294 | 1.124 | -2.341 |
| 2.846282944152314 | -0.291 | 1.114 | -2.324 |
| 2.849424536805904 | -0.288 | 1.103 | -2.306 |
| 2.852566129459494 | -0.285 | 1.093 | -2.287 |
| 2.855707722113083 | -0.282 | 1.082 | -2.269 |
| 2.858849314766673 | -0.279 | 1.072 | -2.25 |
| 2.861990907420262 | -0.276 | 1.061 | -2.232 |
| 2.865132500073852 | -0.273 | 1.05 | -2.213 |
| 2.868274092727442 | -0.27 | 1.04 | -2.193 |
| 2.871415685381031 | -0.267 | 1.029 | -2.174 |
| 2.874557278034621 | -0.264 | 1.018 | -2.154 |
| 2.87769887068821 | -0.261 | 1.007 | -2.135 |
| 2.8808404633418 | -0.258 | 0.996 | -2.115 |
| 2.88398205599539 | -0.255 | 0.985 | -2.094 |
| 2.88712364864898 | -0.252 | 0.975 | -2.074 |
| 2.890265241302569 | -0.249 | 0.964 | -2.054 |
| 2.893406833956158 | -0.246 | 0.952 | -2.033 |
| 2.896548426609748 | -0.243 | 0.941 | -2.012 |
| 2.899690019263338 | -0.24 | 0.93 | -1.991 |
| 2.902831611916927 | -0.236 | 0.919 | -1.97 |
| 2.905973204570517 | -0.233 | 0.908 | -1.948 |
| 2.909114797224106 | -0.23 | 0.897 | -1.927 |
| 2.912256389877696 | -0.227 | 0.886 | -1.905 |
| 2.915397982531286 | -0.224 | 0.874 | -1.883 |
| 2.918539575184875 | -0.221 | 0.863 | -1.861 |
| 2.921681167838465 | -0.218 | 0.852 | -1.839 |
| 2.924822760492054 | -0.215 | 0.84 | -1.816 |
| 2.927964353145644 | -0.212 | 0.829 | -1.794 |
| 2.931105945799234 | -0.209 | 0.817 | -1.771 |
| 2.934247538452823 | -0.206 | 0.806 | -1.748 |
| 2.937389131106413 | -0.203 | 0.794 | -1.725 |
| 2.940530723760002 | -0.2 | 0.783 | -1.702 |
| 2.943672316413592 | -0.197 | 0.771 | -1.678 |
| 2.946813909067182 | -0.194 | 0.76 | -1.655 |
| 2.949955501720771 | -0.19 | 0.748 | -1.631 |
| 2.953097094374361 | -0.187 | 0.736 | -1.607 |
| 2.95623868702795 | -0.184 | 0.725 | -1.584 |
| 2.95938027968154 | -0.181 | 0.713 | -1.559 |
| 2.96252187233513 | -0.178 | 0.701 | -1.535 |
| 2.965663464988719 | -0.175 | 0.689 | -1.511 |
| 2.968805057642309 | -0.172 | 0.677 | -1.486 |
| 2.971946650295898 | -0.169 | 0.666 | -1.462 |
| 2.975088242949488 | -0.166 | 0.654 | -1.437 |
| 2.978229835603078 | -0.163 | 0.642 | -1.412 |
| 2.981371428256667 | -0.16 | 0.63 | -1.387 |
| 2.984513020910257 | -0.156 | 0.618 | -1.362 |
| 2.987654613563846 | -0.153 | 0.606 | -1.337 |
| 2.990796206217436 | -0.15 | 0.594 | -1.311 |
| 2.993937798871025 | -0.147 | 0.582 | -1.286 |
| 2.997079391524615 | -0.144 | 0.57 | -1.26 |
| 3.000220984178205 | -0.141 | 0.558 | -1.235 |
| 3.003362576831794 | -0.138 | 0.546 | -1.209 |
| 3.006504169485384 | -0.135 | 0.534 | -1.183 |
| 3.009645762138974 | -0.132 | 0.522 | -1.157 |
| 3.012787354792563 | -0.128 | 0.51 | -1.131 |
| 3.015928947446153 | -0.125 | 0.497 | -1.104 |
| 3.019070540099742 | -0.122 | 0.485 | -1.078 |
| 3.022212132753332 | -0.119 | 0.473 | -1.052 |
| 3.025353725406922 | -0.116 | 0.461 | -1.025 |
| 3.028495318060511 | -0.113 | 0.449 | -0.998 |
| 3.031636910714101 | -0.11 | 0.436 | -0.972 |
| 3.03477850336769 | -0.107 | 0.424 | -0.945 |
| 3.03792009602128 | -0.103 | 0.412 | -0.918 |
| 3.04106168867487 | -0.1 | 0.399 | -0.891 |
| 3.04420328132846 | -0.097 | 0.387 | -0.864 |
| 3.047344873982049 | -0.094 | 0.375 | -0.837 |
| 3.050486466635638 | -0.091 | 0.362 | -0.81 |
| 3.053628059289228 | -0.088 | 0.35 | -0.783 |
| 3.056769651942818 | -0.085 | 0.338 | -0.755 |
| 3.059911244596407 | -0.082 | 0.325 | -0.728 |
| 3.063052837249997 | -0.078 | 0.313 | -0.7 |
| 3.066194429903586 | -0.075 | 0.3 | -0.673 |
| 3.069336022557176 | -0.072 | 0.288 | -0.645 |
| 3.072477615210766 | -0.069 | 0.276 | -0.618 |
| 3.075619207864355 | -0.066 | 0.263 | -0.59 |
| 3.078760800517945 | -0.063 | 0.251 | -0.562 |
| 3.081902393171534 | -0.06 | 0.238 | -0.534 |
| 3.085043985825124 | -0.057 | 0.226 | -0.507 |
| 3.088185578478713 | -0.053 | 0.213 | -0.479 |
| 3.091327171132303 | -0.05 | 0.201 | -0.451 |
| 3.094468763785893 | -0.047 | 0.188 | -0.423 |
| 3.097610356439482 | -0.044 | 0.176 | -0.395 |
| 3.100751949093072 | -0.041 | 0.163 | -0.367 |
| 3.103893541746661 | -0.038 | 0.151 | -0.339 |
| 3.107035134400251 | -0.035 | 0.138 | -0.31 |
| 3.110176727053841 | -0.031 | 0.126 | -0.282 |
| 3.11331831970743 | -0.028 | 0.113 | -0.254 |
| 3.11645991236102 | -0.025 | 0.1 | -0.226 |
| 3.11960150501461 | -0.022 | 0.088 | -0.198 |
| 3.122743097668199 | -0.019 | 0.075 | -0.17 |
| 3.125884690321789 | -0.016 | 0.063 | -0.141 |
| 3.129026282975378 | -0.013 | 0.05 | -0.113 |
| 3.132167875628968 | -0.009 | 0.038 | -0.085 |
| 3.135309468282557 | -0.006 | 0.025 | -0.057 |
| 3.138451060936147 | -0.003 | 0.013 | -0.028 |
| 3.141592653589737 | 0 | 0 | 0 |
| 3.144734246243326 | 0.003 | -0.013 | 0.028 |
| 3.147875838896916 | 0.006 | -0.025 | 0.057 |
| 3.151017431550505 | 0.009 | -0.038 | 0.085 |
| 3.154159024204095 | 0.013 | -0.05 | 0.113 |
| 3.157300616857685 | 0.016 | -0.063 | 0.141 |
| 3.160442209511274 | 0.019 | -0.075 | 0.17 |
| 3.163583802164864 | 0.022 | -0.088 | 0.198 |
| 3.166725394818453 | 0.025 | -0.1 | 0.226 |
| 3.169866987472043 | 0.028 | -0.113 | 0.254 |
| 3.173008580125633 | 0.031 | -0.126 | 0.282 |
| 3.176150172779222 | 0.035 | -0.138 | 0.31 |
| 3.179291765432812 | 0.038 | -0.151 | 0.339 |
| 3.182433358086401 | 0.041 | -0.163 | 0.367 |
| 3.185574950739991 | 0.044 | -0.176 | 0.395 |
| 3.188716543393581 | 0.047 | -0.188 | 0.423 |
| 3.19185813604717 | 0.05 | -0.201 | 0.451 |
| 3.19499972870076 | 0.053 | -0.213 | 0.479 |
| 3.198141321354349 | 0.057 | -0.226 | 0.507 |
| 3.20128291400794 | 0.06 | -0.238 | 0.534 |
| 3.204424506661528 | 0.063 | -0.251 | 0.562 |
| 3.207566099315118 | 0.066 | -0.263 | 0.59 |
| 3.210707691968708 | 0.069 | -0.276 | 0.618 |
| 3.213849284622297 | 0.072 | -0.288 | 0.645 |
| 3.216990877275887 | 0.075 | -0.3 | 0.673 |
| 3.220132469929476 | 0.078 | -0.313 | 0.7 |
| 3.223274062583066 | 0.082 | -0.325 | 0.728 |
| 3.226415655236656 | 0.085 | -0.338 | 0.755 |
| 3.229557247890245 | 0.088 | -0.35 | 0.783 |
| 3.232698840543835 | 0.091 | -0.362 | 0.81 |
| 3.235840433197425 | 0.094 | -0.375 | 0.837 |
| 3.238982025851014 | 0.097 | -0.387 | 0.864 |
| 3.242123618504604 | 0.1 | -0.399 | 0.891 |
| 3.245265211158193 | 0.103 | -0.412 | 0.918 |
| 3.248406803811783 | 0.107 | -0.424 | 0.945 |
| 3.251548396465373 | 0.11 | -0.436 | 0.972 |
| 3.254689989118962 | 0.113 | -0.449 | 0.998 |
| 3.257831581772551 | 0.116 | -0.461 | 1.025 |
| 3.260973174426141 | 0.119 | -0.473 | 1.052 |
| 3.26411476707973 | 0.122 | -0.485 | 1.078 |
| 3.267256359733321 | 0.125 | -0.497 | 1.104 |
| 3.27039795238691 | 0.128 | -0.51 | 1.131 |
| 3.2735395450405 | 0.132 | -0.522 | 1.157 |
| 3.276681137694089 | 0.135 | -0.534 | 1.183 |
| 3.279822730347679 | 0.138 | -0.546 | 1.209 |
| 3.282964323001269 | 0.141 | -0.558 | 1.235 |
| 3.286105915654858 | 0.144 | -0.57 | 1.26 |
| 3.289247508308448 | 0.147 | -0.582 | 1.286 |
| 3.292389100962037 | 0.15 | -0.594 | 1.311 |
| 3.295530693615627 | 0.153 | -0.606 | 1.337 |
| 3.298672286269217 | 0.156 | -0.618 | 1.362 |
| 3.301813878922806 | 0.16 | -0.63 | 1.387 |
| 3.304955471576396 | 0.163 | -0.642 | 1.412 |
| 3.308097064229985 | 0.166 | -0.654 | 1.437 |
| 3.311238656883575 | 0.169 | -0.666 | 1.462 |
| 3.314380249537165 | 0.172 | -0.677 | 1.486 |
| 3.317521842190754 | 0.175 | -0.689 | 1.511 |
| 3.320663434844344 | 0.178 | -0.701 | 1.535 |
| 3.323805027497933 | 0.181 | -0.713 | 1.559 |
| 3.326946620151523 | 0.184 | -0.725 | 1.584 |
| 3.330088212805113 | 0.187 | -0.736 | 1.607 |
| 3.333229805458702 | 0.19 | -0.748 | 1.631 |
| 3.336371398112292 | 0.194 | -0.76 | 1.655 |
| 3.339512990765881 | 0.197 | -0.771 | 1.678 |
| 3.342654583419471 | 0.2 | -0.783 | 1.702 |
| 3.345796176073061 | 0.203 | -0.794 | 1.725 |
| 3.34893776872665 | 0.206 | -0.806 | 1.748 |
| 3.35207936138024 | 0.209 | -0.817 | 1.771 |
| 3.355220954033829 | 0.212 | -0.829 | 1.794 |
| 3.358362546687419 | 0.215 | -0.84 | 1.816 |
| 3.361504139341009 | 0.218 | -0.852 | 1.839 |
| 3.364645731994598 | 0.221 | -0.863 | 1.861 |
| 3.367787324648188 | 0.224 | -0.874 | 1.883 |
| 3.370928917301777 | 0.227 | -0.886 | 1.905 |
| 3.374070509955367 | 0.23 | -0.897 | 1.927 |
| 3.377212102608956 | 0.233 | -0.908 | 1.948 |
| 3.380353695262546 | 0.236 | -0.919 | 1.97 |
| 3.383495287916136 | 0.24 | -0.93 | 1.991 |
| 3.386636880569725 | 0.243 | -0.941 | 2.012 |
| 3.389778473223315 | 0.246 | -0.952 | 2.033 |
| 3.392920065876904 | 0.249 | -0.964 | 2.054 |
| 3.396061658530494 | 0.252 | -0.975 | 2.074 |
| 3.399203251184084 | 0.255 | -0.985 | 2.094 |
| 3.402344843837673 | 0.258 | -0.996 | 2.115 |
| 3.405486436491263 | 0.261 | -1.007 | 2.135 |
| 3.408628029144852 | 0.264 | -1.018 | 2.154 |
| 3.411769621798442 | 0.267 | -1.029 | 2.174 |
| 3.414911214452032 | 0.27 | -1.04 | 2.193 |
| 3.418052807105621 | 0.273 | -1.05 | 2.213 |
| 3.421194399759211 | 0.276 | -1.061 | 2.232 |
| 3.4243359924128 | 0.279 | -1.072 | 2.25 |
| 3.42747758506639 | 0.282 | -1.082 | 2.269 |
| 3.43061917771998 | 0.285 | -1.093 | 2.287 |
| 3.433760770373569 | 0.288 | -1.103 | 2.306 |
| 3.436902363027159 | 0.291 | -1.114 | 2.324 |
| 3.440043955680748 | 0.294 | -1.124 | 2.341 |
| 3.443185548334338 | 0.297 | -1.135 | 2.359 |
| 3.446327140987927 | 0.3 | -1.145 | 2.376 |
| 3.449468733641517 | 0.303 | -1.155 | 2.393 |
| 3.452610326295107 | 0.306 | -1.165 | 2.41 |
| 3.455751918948696 | 0.309 | -1.176 | 2.427 |
| 3.458893511602286 | 0.312 | -1.186 | 2.444 |
| 3.462035104255876 | 0.315 | -1.196 | 2.46 |
| 3.465176696909465 | 0.318 | -1.206 | 2.476 |
| 3.468318289563055 | 0.321 | -1.216 | 2.492 |
| 3.471459882216644 | 0.324 | -1.226 | 2.507 |
| 3.474601474870234 | 0.327 | -1.236 | 2.523 |
| 3.477743067523824 | 0.33 | -1.246 | 2.538 |
| 3.480884660177413 | 0.333 | -1.255 | 2.553 |
| 3.484026252831002 | 0.336 | -1.265 | 2.568 |
| 3.487167845484592 | 0.339 | -1.275 | 2.582 |
| 3.490309438138182 | 0.342 | -1.285 | 2.597 |
| 3.493451030791772 | 0.345 | -1.294 | 2.611 |
| 3.496592623445361 | 0.348 | -1.304 | 2.624 |
| 3.499734216098951 | 0.351 | -1.313 | 2.638 |
| 3.50287580875254 | 0.353 | -1.323 | 2.651 |
| 3.50601740140613 | 0.356 | -1.332 | 2.664 |
| 3.50915899405972 | 0.359 | -1.341 | 2.677 |
| 3.512300586713309 | 0.362 | -1.351 | 2.69 |
| 3.515442179366899 | 0.365 | -1.36 | 2.702 |
| 3.518583772020488 | 0.368 | -1.369 | 2.714 |
| 3.521725364674078 | 0.371 | -1.378 | 2.726 |
| 3.524866957327668 | 0.374 | -1.387 | 2.738 |
| 3.528008549981257 | 0.377 | -1.396 | 2.75 |
| 3.531150142634847 | 0.38 | -1.405 | 2.761 |
| 3.534291735288436 | 0.383 | -1.414 | 2.772 |
| 3.537433327942026 | 0.386 | -1.423 | 2.782 |
| 3.540574920595616 | 0.388 | -1.432 | 2.793 |
| 3.543716513249205 | 0.391 | -1.441 | 2.803 |
| 3.546858105902795 | 0.394 | -1.449 | 2.813 |
| 3.549999698556384 | 0.397 | -1.458 | 2.823 |
| 3.553141291209974 | 0.4 | -1.467 | 2.832 |
| 3.556282883863564 | 0.403 | -1.475 | 2.841 |
| 3.559424476517153 | 0.406 | -1.483 | 2.85 |
| 3.562566069170743 | 0.409 | -1.492 | 2.859 |
| 3.565707661824332 | 0.412 | -1.5 | 2.867 |
| 3.568849254477922 | 0.414 | -1.509 | 2.876 |
| 3.571990847131511 | 0.417 | -1.517 | 2.883 |
| 3.575132439785101 | 0.42 | -1.525 | 2.891 |
| 3.578274032438691 | 0.423 | -1.533 | 2.899 |
| 3.58141562509228 | 0.426 | -1.541 | 2.906 |
| 3.58455721774587 | 0.429 | -1.549 | 2.913 |
| 3.58769881039946 | 0.431 | -1.557 | 2.919 |
| 3.590840403053049 | 0.434 | -1.565 | 2.926 |
| 3.593981995706639 | 0.437 | -1.573 | 2.932 |
| 3.597123588360228 | 0.44 | -1.58 | 2.938 |
| 3.600265181013818 | 0.443 | -1.588 | 2.943 |
| 3.603406773667407 | 0.446 | -1.596 | 2.949 |
| 3.606548366320997 | 0.448 | -1.603 | 2.954 |
| 3.609689958974587 | 0.451 | -1.611 | 2.959 |
| 3.612831551628176 | 0.454 | -1.618 | 2.963 |
| 3.615973144281766 | 0.457 | -1.625 | 2.967 |
| 3.619114736935355 | 0.46 | -1.633 | 2.971 |
| 3.622256329588945 | 0.462 | -1.64 | 2.975 |
| 3.625397922242534 | 0.465 | -1.647 | 2.979 |
| 3.628539514896124 | 0.468 | -1.654 | 2.982 |
| 3.631681107549714 | 0.471 | -1.661 | 2.985 |
| 3.634822700203303 | 0.473 | -1.668 | 2.988 |
| 3.637964292856893 | 0.476 | -1.675 | 2.99 |
| 3.641105885510483 | 0.479 | -1.682 | 2.992 |
| 3.644247478164072 | 0.482 | -1.689 | 2.994 |
| 3.647389070817662 | 0.485 | -1.695 | 2.996 |
| 3.650530663471251 | 0.487 | -1.702 | 2.997 |
| 3.653672256124841 | 0.49 | -1.709 | 2.998 |
| 3.656813848778431 | 0.493 | -1.715 | 2.999 |
| 3.65995544143202 | 0.495 | -1.721 | 3 |
| 3.66309703408561 | 0.498 | -1.728 | 3 |
| 3.666238626739199 | 0.501 | -1.734 | 3 |
| 3.66938021939279 | 0.504 | -1.74 | 3 |
| 3.672521812046378 | 0.506 | -1.747 | 2.999 |
| 3.675663404699968 | 0.509 | -1.753 | 2.999 |
| 3.678804997353558 | 0.512 | -1.759 | 2.997 |
| 3.681946590007147 | 0.514 | -1.765 | 2.996 |
| 3.685088182660737 | 0.517 | -1.77 | 2.995 |
| 3.688229775314326 | 0.52 | -1.776 | 2.993 |
| 3.691371367967916 | 0.522 | -1.782 | 2.991 |
| 3.694512960621506 | 0.525 | -1.788 | 2.988 |
| 3.697654553275095 | 0.528 | -1.793 | 2.986 |
| 3.700796145928685 | 0.531 | -1.799 | 2.983 |
| 3.703937738582274 | 0.533 | -1.804 | 2.98 |
| 3.707079331235864 | 0.536 | -1.81 | 2.976 |
| 3.710220923889454 | 0.538 | -1.815 | 2.973 |
| 3.713362516543043 | 0.541 | -1.82 | 2.969 |
| 3.716504109196633 | 0.544 | -1.825 | 2.965 |
| 3.719645701850223 | 0.546 | -1.83 | 2.96 |
| 3.722787294503812 | 0.549 | -1.836 | 2.955 |
| 3.725928887157402 | 0.552 | -1.84 | 2.95 |
| 3.729070479810991 | 0.554 | -1.845 | 2.945 |
| 3.732212072464581 | 0.557 | -1.85 | 2.94 |
| 3.735353665118171 | 0.559 | -1.855 | 2.934 |
| 3.73849525777176 | 0.562 | -1.86 | 2.928 |
| 3.74163685042535 | 0.565 | -1.864 | 2.921 |
| 3.744778443078939 | 0.567 | -1.869 | 2.915 |
| 3.747920035732529 | 0.57 | -1.873 | 2.908 |
| 3.751061628386119 | 0.572 | -1.877 | 2.901 |
| 3.754203221039708 | 0.575 | -1.882 | 2.894 |
| 3.757344813693298 | 0.578 | -1.886 | 2.886 |
| 3.760486406346887 | 0.58 | -1.89 | 2.878 |
| 3.763627999000477 | 0.583 | -1.894 | 2.87 |
| 3.766769591654067 | 0.585 | -1.898 | 2.862 |
| 3.769911184307656 | 0.588 | -1.902 | 2.853 |
| 3.773052776961246 | 0.59 | -1.906 | 2.844 |
| 3.776194369614835 | 0.593 | -1.91 | 2.835 |
| 3.779335962268425 | 0.595 | -1.913 | 2.826 |
| 3.782477554922014 | 0.598 | -1.917 | 2.816 |
| 3.785619147575604 | 0.6 | -1.921 | 2.806 |
| 3.788760740229193 | 0.603 | -1.924 | 2.796 |
| 3.791902332882783 | 0.605 | -1.927 | 2.786 |
| 3.795043925536373 | 0.608 | -1.931 | 2.775 |
| 3.798185518189962 | 0.61 | -1.934 | 2.764 |
| 3.801327110843552 | 0.613 | -1.937 | 2.753 |
| 3.804468703497142 | 0.615 | -1.94 | 2.742 |
| 3.807610296150731 | 0.618 | -1.943 | 2.73 |
| 3.810751888804321 | 0.62 | -1.946 | 2.718 |
| 3.813893481457911 | 0.623 | -1.949 | 2.706 |
| 3.8170350741115 | 0.625 | -1.952 | 2.694 |
| 3.82017666676509 | 0.628 | -1.955 | 2.682 |
| 3.823318259418679 | 0.63 | -1.957 | 2.669 |
| 3.826459852072269 | 0.633 | -1.96 | 2.656 |
| 3.829601444725859 | 0.635 | -1.962 | 2.642 |
| 3.832743037379448 | 0.637 | -1.965 | 2.629 |
| 3.835884630033038 | 0.64 | -1.967 | 2.615 |
| 3.839026222686627 | 0.642 | -1.969 | 2.601 |
| 3.842167815340217 | 0.645 | -1.971 | 2.587 |
| 3.845309407993807 | 0.647 | -1.973 | 2.573 |
| 3.848451000647396 | 0.649 | -1.975 | 2.558 |
| 3.851592593300986 | 0.652 | -1.977 | 2.543 |
| 3.854734185954575 | 0.654 | -1.979 | 2.528 |
| 3.857875778608165 | 0.657 | -1.981 | 2.513 |
| 3.861017371261755 | 0.659 | -1.983 | 2.497 |
| 3.864158963915344 | 0.661 | -1.984 | 2.481 |
| 3.867300556568933 | 0.664 | -1.986 | 2.465 |
| 3.870442149222523 | 0.666 | -1.987 | 2.449 |
| 3.873583741876112 | 0.668 | -1.989 | 2.433 |
| 3.876725334529703 | 0.671 | -1.99 | 2.416 |
| 3.879866927183292 | 0.673 | -1.991 | 2.399 |
| 3.883008519836882 | 0.675 | -1.992 | 2.382 |
| 3.886150112490471 | 0.678 | -1.993 | 2.365 |
| 3.889291705144061 | 0.68 | -1.994 | 2.347 |
| 3.892433297797651 | 0.682 | -1.995 | 2.329 |
| 3.89557489045124 | 0.685 | -1.996 | 2.312 |
| 3.89871648310483 | 0.687 | -1.997 | 2.293 |
| 3.901858075758419 | 0.689 | -1.997 | 2.275 |
| 3.904999668412009 | 0.691 | -1.998 | 2.257 |
| 3.908141261065598 | 0.694 | -1.999 | 2.238 |
| 3.911282853719188 | 0.696 | -1.999 | 2.219 |
| 3.914424446372778 | 0.698 | -1.999 | 2.2 |
| 3.917566039026367 | 0.7 | -2 | 2.18 |
| 3.920707631679957 | 0.703 | -2 | 2.161 |
| 3.923849224333547 | 0.705 | -2 | 2.141 |
| 3.926990816987136 | 0.707 | -2 | 2.121 |
| 3.930132409640726 | 0.709 | -2 | 2.101 |
| 3.933274002294315 | 0.712 | -2 | 2.081 |
| 3.936415594947905 | 0.714 | -2 | 2.061 |
| 3.939557187601495 | 0.716 | -1.999 | 2.04 |
| 3.942698780255084 | 0.718 | -1.999 | 2.019 |
| 3.945840372908674 | 0.72 | -1.999 | 1.998 |
| 3.948981965562263 | 0.722 | -1.998 | 1.977 |
| 3.952123558215853 | 0.725 | -1.997 | 1.956 |
| 3.955265150869442 | 0.727 | -1.997 | 1.934 |
| 3.958406743523032 | 0.729 | -1.996 | 1.912 |
| 3.961548336176622 | 0.731 | -1.995 | 1.89 |
| 3.964689928830211 | 0.733 | -1.994 | 1.868 |
| 3.967831521483801 | 0.735 | -1.993 | 1.846 |
| 3.97097311413739 | 0.738 | -1.992 | 1.824 |
| 3.97411470679098 | 0.74 | -1.991 | 1.801 |
| 3.97725629944457 | 0.742 | -1.99 | 1.779 |
| 3.98039789209816 | 0.744 | -1.989 | 1.756 |
| 3.983539484751749 | 0.746 | -1.987 | 1.733 |
| 3.986681077405338 | 0.748 | -1.986 | 1.71 |
| 3.989822670058928 | 0.75 | -1.984 | 1.686 |
| 3.992964262712517 | 0.752 | -1.983 | 1.663 |
| 3.996105855366107 | 0.754 | -1.981 | 1.639 |
| 3.999247448019697 | 0.756 | -1.979 | 1.615 |
| 4.002389040673287 | 0.758 | -1.977 | 1.592 |
| 4.005530633326877 | 0.76 | -1.975 | 1.567 |
| 4.008672225980466 | 0.762 | -1.973 | 1.543 |
| 4.011813818634056 | 0.764 | -1.971 | 1.519 |
| 4.014955411287645 | 0.766 | -1.969 | 1.495 |
| 4.018097003941234 | 0.769 | -1.967 | 1.47 |
| 4.021238596594824 | 0.771 | -1.965 | 1.445 |
| 4.024380189248414 | 0.773 | -1.962 | 1.42 |
| 4.027521781902004 | 0.775 | -1.96 | 1.395 |
| 4.030663374555593 | 0.776 | -1.957 | 1.37 |
| 4.033804967209183 | 0.778 | -1.955 | 1.345 |
| 4.036946559862773 | 0.78 | -1.952 | 1.32 |
| 4.040088152516362 | 0.782 | -1.949 | 1.294 |
| 4.043229745169951 | 0.784 | -1.946 | 1.269 |
| 4.046371337823541 | 0.786 | -1.943 | 1.243 |
| 4.049512930477131 | 0.788 | -1.94 | 1.217 |
| 4.05265452313072 | 0.79 | -1.937 | 1.191 |
| 4.05579611578431 | 0.792 | -1.934 | 1.165 |
| 4.0589377084379 | 0.794 | -1.931 | 1.139 |
| 4.062079301091489 | 0.796 | -1.927 | 1.113 |
| 4.065220893745079 | 0.798 | -1.924 | 1.087 |
| 4.068362486398668 | 0.8 | -1.921 | 1.06 |
| 4.071504079052258 | 0.802 | -1.917 | 1.034 |
| 4.074645671705848 | 0.803 | -1.913 | 1.007 |
| 4.077787264359437 | 0.805 | -1.91 | 0.981 |
| 4.080928857013027 | 0.807 | -1.906 | 0.954 |
| 4.084070449666616 | 0.809 | -1.902 | 0.927 |
| 4.087212042320206 | 0.811 | -1.898 | 0.9 |
| 4.090353634973795 | 0.813 | -1.894 | 0.873 |
| 4.093495227627385 | 0.815 | -1.89 | 0.846 |
| 4.096636820280975 | 0.816 | -1.886 | 0.819 |
| 4.099778412934564 | 0.818 | -1.882 | 0.792 |
| 4.102920005588154 | 0.82 | -1.877 | 0.764 |
| 4.106061598241744 | 0.822 | -1.873 | 0.737 |
| 4.109203190895333 | 0.824 | -1.869 | 0.709 |
| 4.112344783548923 | 0.825 | -1.864 | 0.682 |
| 4.115486376202512 | 0.827 | -1.86 | 0.654 |
| 4.118627968856102 | 0.829 | -1.855 | 0.627 |
| 4.121769561509692 | 0.831 | -1.85 | 0.599 |
| 4.124911154163281 | 0.832 | -1.845 | 0.571 |
| 4.128052746816871 | 0.834 | -1.84 | 0.544 |
| 4.13119433947046 | 0.836 | -1.836 | 0.516 |
| 4.13433593212405 | 0.838 | -1.83 | 0.488 |
| 4.13747752477764 | 0.839 | -1.825 | 0.46 |
| 4.14061911743123 | 0.841 | -1.82 | 0.432 |
| 4.143760710084818 | 0.843 | -1.815 | 0.404 |
| 4.146902302738408 | 0.844 | -1.81 | 0.376 |
| 4.150043895391998 | 0.846 | -1.804 | 0.348 |
| 4.153185488045588 | 0.848 | -1.799 | 0.32 |
| 4.156327080699177 | 0.849 | -1.793 | 0.292 |
| 4.159468673352766 | 0.851 | -1.788 | 0.264 |
| 4.162610266006356 | 0.853 | -1.782 | 0.235 |
| 4.165751858659946 | 0.854 | -1.776 | 0.207 |
| 4.168893451313535 | 0.856 | -1.77 | 0.179 |
| 4.172035043967125 | 0.858 | -1.765 | 0.151 |
| 4.175176636620715 | 0.859 | -1.759 | 0.122 |
| 4.178318229274304 | 0.861 | -1.753 | 0.094 |
| 4.181459821927894 | 0.862 | -1.747 | 0.066 |
| 4.184601414581484 | 0.864 | -1.74 | 0.038 |
| 4.187743007235073 | 0.866 | -1.734 | 0.009 |
| 4.190884599888663 | 0.867 | -1.728 | -0.019 |
| 4.194026192542252 | 0.869 | -1.721 | -0.047 |
| 4.197167785195842 | 0.87 | -1.715 | -0.075 |
| 4.200309377849432 | 0.872 | -1.709 | -0.104 |
| 4.203450970503021 | 0.873 | -1.702 | -0.132 |
| 4.206592563156611 | 0.875 | -1.695 | -0.16 |
| 4.2097341558102 | 0.876 | -1.689 | -0.188 |
| 4.21287574846379 | 0.878 | -1.682 | -0.217 |
| 4.21601734111738 | 0.879 | -1.675 | -0.245 |
| 4.21915893377097 | 0.881 | -1.668 | -0.273 |
| 4.222300526424559 | 0.882 | -1.661 | -0.301 |
| 4.225442119078148 | 0.884 | -1.654 | -0.329 |
| 4.228583711731738 | 0.885 | -1.647 | -0.357 |
| 4.231725304385327 | 0.887 | -1.64 | -0.385 |
| 4.234866897038917 | 0.888 | -1.633 | -0.413 |
| 4.238008489692506 | 0.89 | -1.625 | -0.441 |
| 4.241150082346096 | 0.891 | -1.618 | -0.469 |
| 4.244291674999685 | 0.892 | -1.611 | -0.497 |
| 4.247433267653276 | 0.894 | -1.603 | -0.525 |
| 4.250574860306865 | 0.895 | -1.596 | -0.553 |
| 4.253716452960455 | 0.897 | -1.588 | -0.581 |
| 4.256858045614044 | 0.898 | -1.58 | -0.608 |
| 4.259999638267634 | 0.899 | -1.573 | -0.636 |
| 4.263141230921224 | 0.901 | -1.565 | -0.664 |
| 4.266282823574813 | 0.902 | -1.557 | -0.691 |
| 4.269424416228403 | 0.903 | -1.549 | -0.719 |
| 4.272566008881992 | 0.905 | -1.541 | -0.746 |
| 4.275707601535582 | 0.906 | -1.533 | -0.773 |
| 4.27884919418917 | 0.907 | -1.525 | -0.801 |
| 4.28199078684276 | 0.909 | -1.517 | -0.828 |
| 4.285132379496351 | 0.91 | -1.509 | -0.855 |
| 4.28827397214994 | 0.911 | -1.5 | -0.882 |
| 4.29141556480353 | 0.913 | -1.492 | -0.909 |
| 4.294557157457119 | 0.914 | -1.483 | -0.936 |
| 4.29769875011071 | 0.915 | -1.475 | -0.963 |
| 4.300840342764299 | 0.917 | -1.467 | -0.99 |
| 4.303981935417888 | 0.918 | -1.458 | -1.016 |
| 4.307123528071478 | 0.919 | -1.449 | -1.043 |
| 4.310265120725067 | 0.92 | -1.441 | -1.069 |
| 4.313406713378657 | 0.921 | -1.432 | -1.096 |
| 4.316548306032247 | 0.923 | -1.423 | -1.122 |
| 4.319689898685836 | 0.924 | -1.414 | -1.148 |
| 4.322831491339426 | 0.925 | -1.405 | -1.174 |
| 4.325973083993015 | 0.926 | -1.396 | -1.2 |
| 4.329114676646605 | 0.927 | -1.387 | -1.226 |
| 4.332256269300195 | 0.929 | -1.378 | -1.252 |
| 4.335397861953784 | 0.93 | -1.369 | -1.277 |
| 4.338539454607374 | 0.931 | -1.36 | -1.303 |
| 4.341681047260963 | 0.932 | -1.351 | -1.328 |
| 4.344822639914553 | 0.933 | -1.341 | -1.354 |
| 4.347964232568143 | 0.934 | -1.332 | -1.379 |
| 4.351105825221732 | 0.935 | -1.323 | -1.404 |
| 4.354247417875322 | 0.937 | -1.313 | -1.429 |
| 4.357389010528911 | 0.938 | -1.304 | -1.454 |
| 4.360530603182501 | 0.939 | -1.294 | -1.478 |
| 4.36367219583609 | 0.94 | -1.285 | -1.503 |
| 4.36681378848968 | 0.941 | -1.275 | -1.527 |
| 4.36995538114327 | 0.942 | -1.265 | -1.551 |
| 4.373096973796859 | 0.943 | -1.255 | -1.576 |
| 4.376238566450449 | 0.944 | -1.246 | -1.6 |
| 4.379380159104038 | 0.945 | -1.236 | -1.623 |
| 4.382521751757628 | 0.946 | -1.226 | -1.647 |
| 4.385663344411217 | 0.947 | -1.216 | -1.671 |
| 4.388804937064807 | 0.948 | -1.206 | -1.694 |
| 4.391946529718397 | 0.949 | -1.196 | -1.717 |
| 4.395088122371987 | 0.95 | -1.186 | -1.74 |
| 4.398229715025576 | 0.951 | -1.176 | -1.763 |
| 4.401371307679165 | 0.952 | -1.165 | -1.786 |
| 4.404512900332755 | 0.953 | -1.155 | -1.809 |
| 4.407654492986345 | 0.954 | -1.145 | -1.831 |
| 4.410796085639934 | 0.955 | -1.135 | -1.854 |
| 4.413937678293524 | 0.956 | -1.124 | -1.876 |
| 4.417079270947114 | 0.957 | -1.114 | -1.898 |
| 4.420220863600703 | 0.958 | -1.103 | -1.92 |
| 4.423362456254293 | 0.959 | -1.093 | -1.941 |
| 4.426504048907883 | 0.959 | -1.082 | -1.963 |
| 4.429645641561472 | 0.96 | -1.072 | -1.984 |
| 4.432787234215062 | 0.961 | -1.061 | -2.005 |
| 4.435928826868651 | 0.962 | -1.05 | -2.026 |
| 4.43907041952224 | 0.963 | -1.04 | -2.047 |
| 4.44221201217583 | 0.964 | -1.029 | -2.067 |
| 4.44535360482942 | 0.965 | -1.018 | -2.088 |
| 4.44849519748301 | 0.965 | -1.007 | -2.108 |
| 4.4516367901366 | 0.966 | -0.996 | -2.128 |
| 4.454778382790188 | 0.967 | -0.985 | -2.148 |
| 4.457919975443779 | 0.968 | -0.975 | -2.167 |
| 4.461061568097368 | 0.969 | -0.964 | -2.187 |
| 4.464203160750958 | 0.969 | -0.952 | -2.206 |
| 4.467344753404547 | 0.97 | -0.941 | -2.225 |
| 4.470486346058137 | 0.971 | -0.93 | -2.244 |
| 4.473627938711726 | 0.972 | -0.919 | -2.263 |
| 4.476769531365316 | 0.972 | -0.908 | -2.281 |
| 4.479911124018905 | 0.973 | -0.897 | -2.299 |
| 4.483052716672495 | 0.974 | -0.886 | -2.318 |
| 4.486194309326085 | 0.975 | -0.874 | -2.335 |
| 4.489335901979674 | 0.975 | -0.863 | -2.353 |
| 4.492477494633264 | 0.976 | -0.852 | -2.37 |
| 4.495619087286854 | 0.977 | -0.84 | -2.388 |
| 4.498760679940443 | 0.977 | -0.829 | -2.405 |
| 4.501902272594033 | 0.978 | -0.817 | -2.421 |
| 4.505043865247622 | 0.979 | -0.806 | -2.438 |
| 4.508185457901212 | 0.979 | -0.794 | -2.454 |
| 4.511327050554801 | 0.98 | -0.783 | -2.471 |
| 4.514468643208391 | 0.98 | -0.771 | -2.487 |
| 4.517610235861981 | 0.981 | -0.76 | -2.502 |
| 4.520751828515571 | 0.982 | -0.748 | -2.518 |
| 4.52389342116916 | 0.982 | -0.736 | -2.533 |
| 4.52703501382275 | 0.983 | -0.725 | -2.548 |
| 4.530176606476339 | 0.983 | -0.713 | -2.563 |
| 4.533318199129928 | 0.984 | -0.701 | -2.577 |
| 4.536459791783518 | 0.985 | -0.689 | -2.592 |
| 4.539601384437108 | 0.985 | -0.677 | -2.606 |
| 4.542742977090698 | 0.986 | -0.666 | -2.62 |
| 4.545884569744287 | 0.986 | -0.654 | -2.633 |
| 4.549026162397876 | 0.987 | -0.642 | -2.647 |
| 4.552167755051466 | 0.987 | -0.63 | -2.66 |
| 4.555309347705056 | 0.988 | -0.618 | -2.673 |
| 4.558450940358646 | 0.988 | -0.606 | -2.686 |
| 4.561592533012235 | 0.989 | -0.594 | -2.698 |
| 4.564734125665825 | 0.989 | -0.582 | -2.71 |
| 4.567875718319415 | 0.99 | -0.57 | -2.722 |
| 4.571017310973004 | 0.99 | -0.558 | -2.734 |
| 4.574158903626594 | 0.99 | -0.546 | -2.746 |
| 4.577300496280183 | 0.991 | -0.534 | -2.757 |
| 4.580442088933772 | 0.991 | -0.522 | -2.768 |
| 4.583583681587362 | 0.992 | -0.51 | -2.779 |
| 4.586725274240952 | 0.992 | -0.497 | -2.789 |
| 4.589866866894542 | 0.993 | -0.485 | -2.8 |
| 4.593008459548131 | 0.993 | -0.473 | -2.81 |
| 4.596150052201721 | 0.993 | -0.461 | -2.819 |
| 4.59929164485531 | 0.994 | -0.449 | -2.829 |
| 4.6024332375089 | 0.994 | -0.436 | -2.838 |
| 4.60557483016249 | 0.994 | -0.424 | -2.847 |
| 4.608716422816079 | 0.995 | -0.412 | -2.856 |
| 4.611858015469668 | 0.995 | -0.399 | -2.865 |
| 4.614999608123258 | 0.995 | -0.387 | -2.873 |
| 4.618141200776848 | 0.996 | -0.375 | -2.881 |
| 4.621282793430437 | 0.996 | -0.362 | -2.889 |
| 4.624424386084027 | 0.996 | -0.35 | -2.896 |
| 4.627565978737617 | 0.996 | -0.338 | -2.903 |
| 4.630707571391206 | 0.997 | -0.325 | -2.91 |
| 4.633849164044795 | 0.997 | -0.313 | -2.917 |
| 4.636990756698386 | 0.997 | -0.3 | -2.924 |
| 4.640132349351975 | 0.997 | -0.288 | -2.93 |
| 4.643273942005564 | 0.998 | -0.276 | -2.936 |
| 4.646415534659154 | 0.998 | -0.263 | -2.941 |
| 4.649557127312744 | 0.998 | -0.251 | -2.947 |
| 4.652698719966334 | 0.998 | -0.238 | -2.952 |
| 4.655840312619923 | 0.998 | -0.226 | -2.957 |
| 4.658981905273513 | 0.999 | -0.213 | -2.962 |
| 4.662123497927102 | 0.999 | -0.201 | -2.966 |
| 4.665265090580692 | 0.999 | -0.188 | -2.97 |
| 4.668406683234282 | 0.999 | -0.176 | -2.974 |
| 4.671548275887871 | 0.999 | -0.163 | -2.978 |
| 4.674689868541461 | 0.999 | -0.151 | -2.981 |
| 4.67783146119505 | 0.999 | -0.138 | -2.984 |
| 4.68097305384864 | 1 | -0.126 | -2.987 |
| 4.68411464650223 | 1 | -0.113 | -2.989 |
| 4.687256239155819 | 1 | -0.1 | -2.991 |
| 4.690397831809409 | 1 | -0.088 | -2.993 |
| 4.693539424462998 | 1 | -0.075 | -2.995 |
| 4.696681017116588 | 1 | -0.063 | -2.997 |
| 4.699822609770177 | 1 | -0.05 | -2.998 |
| 4.702964202423767 | 1 | -0.038 | -2.999 |
| 4.706105795077356 | 1 | -0.025 | -2.999 |
| 4.709247387730946 | 1 | -0.013 | -3 |
| 4.712388980384535 | 1 | 0 | -3 |
| 4.715530573038126 | 1 | 0.013 | -3 |
| 4.718672165691715 | 1 | 0.025 | -2.999 |
| 4.721813758345305 | 1 | 0.038 | -2.999 |
| 4.724955350998894 | 1 | 0.05 | -2.998 |
| 4.728096943652484 | 1 | 0.063 | -2.997 |
| 4.731238536306074 | 1 | 0.075 | -2.995 |
| 4.734380128959663 | 1 | 0.088 | -2.993 |
| 4.737521721613253 | 1 | 0.1 | -2.991 |
| 4.740663314266842 | 1 | 0.113 | -2.989 |
| 4.743804906920432 | 1 | 0.126 | -2.987 |
| 4.74694649957402 | 0.999 | 0.138 | -2.984 |
| 4.750088092227611 | 0.999 | 0.151 | -2.981 |
| 4.7532296848812 | 0.999 | 0.163 | -2.978 |
| 4.75637127753479 | 0.999 | 0.176 | -2.974 |
| 4.75951287018838 | 0.999 | 0.188 | -2.97 |
| 4.76265446284197 | 0.999 | 0.201 | -2.966 |
| 4.765796055495559 | 0.999 | 0.213 | -2.962 |
| 4.768937648149149 | 0.998 | 0.226 | -2.957 |
| 4.772079240802738 | 0.998 | 0.238 | -2.952 |
| 4.775220833456327 | 0.998 | 0.251 | -2.947 |
| 4.778362426109917 | 0.998 | 0.263 | -2.941 |
| 4.781504018763507 | 0.998 | 0.276 | -2.936 |
| 4.784645611417097 | 0.997 | 0.288 | -2.93 |
| 4.787787204070686 | 0.997 | 0.3 | -2.924 |
| 4.790928796724275 | 0.997 | 0.313 | -2.917 |
| 4.794070389377865 | 0.997 | 0.325 | -2.91 |
| 4.797211982031455 | 0.996 | 0.338 | -2.903 |
| 4.800353574685045 | 0.996 | 0.35 | -2.896 |
| 4.803495167338634 | 0.996 | 0.362 | -2.889 |
| 4.806636759992224 | 0.996 | 0.375 | -2.881 |
| 4.809778352645814 | 0.995 | 0.387 | -2.873 |
| 4.812919945299403 | 0.995 | 0.399 | -2.865 |
| 4.816061537952993 | 0.995 | 0.412 | -2.856 |
| 4.819203130606582 | 0.994 | 0.424 | -2.847 |
| 4.822344723260172 | 0.994 | 0.436 | -2.838 |
| 4.825486315913761 | 0.994 | 0.449 | -2.829 |
| 4.828627908567351 | 0.993 | 0.461 | -2.819 |
| 4.83176950122094 | 0.993 | 0.473 | -2.81 |
| 4.83491109387453 | 0.993 | 0.485 | -2.8 |
| 4.83805268652812 | 0.992 | 0.497 | -2.789 |
| 4.841194279181709 | 0.992 | 0.51 | -2.779 |
| 4.844335871835299 | 0.991 | 0.522 | -2.768 |
| 4.847477464488889 | 0.991 | 0.534 | -2.757 |
| 4.850619057142478 | 0.99 | 0.546 | -2.746 |
| 4.853760649796068 | 0.99 | 0.558 | -2.734 |
| 4.856902242449657 | 0.99 | 0.57 | -2.722 |
| 4.860043835103247 | 0.989 | 0.582 | -2.71 |
| 4.863185427756837 | 0.989 | 0.594 | -2.698 |
| 4.866327020410426 | 0.988 | 0.606 | -2.686 |
| 4.869468613064015 | 0.988 | 0.618 | -2.673 |
| 4.872610205717605 | 0.987 | 0.63 | -2.66 |
| 4.875751798371195 | 0.987 | 0.642 | -2.647 |
| 4.878893391024784 | 0.986 | 0.654 | -2.633 |
| 4.882034983678374 | 0.986 | 0.666 | -2.62 |
| 4.885176576331964 | 0.985 | 0.677 | -2.606 |
| 4.888318168985553 | 0.985 | 0.689 | -2.592 |
| 4.891459761639143 | 0.984 | 0.701 | -2.577 |
| 4.894601354292733 | 0.983 | 0.713 | -2.563 |
| 4.897742946946322 | 0.983 | 0.725 | -2.548 |
| 4.900884539599912 | 0.982 | 0.736 | -2.533 |
| 4.904026132253501 | 0.982 | 0.748 | -2.518 |
| 4.907167724907091 | 0.981 | 0.76 | -2.502 |
| 4.91030931756068 | 0.98 | 0.771 | -2.487 |
| 4.91345091021427 | 0.98 | 0.783 | -2.471 |
| 4.91659250286786 | 0.979 | 0.794 | -2.454 |
| 4.91973409552145 | 0.979 | 0.806 | -2.438 |
| 4.922875688175039 | 0.978 | 0.817 | -2.421 |
| 4.926017280828628 | 0.977 | 0.829 | -2.405 |
| 4.929158873482218 | 0.977 | 0.84 | -2.388 |
| 4.932300466135808 | 0.976 | 0.852 | -2.37 |
| 4.935442058789397 | 0.975 | 0.863 | -2.353 |
| 4.938583651442987 | 0.975 | 0.874 | -2.335 |
| 4.941725244096576 | 0.974 | 0.886 | -2.318 |
| 4.944866836750166 | 0.973 | 0.897 | -2.299 |
| 4.948008429403755 | 0.972 | 0.908 | -2.281 |
| 4.951150022057345 | 0.972 | 0.919 | -2.263 |
| 4.954291614710935 | 0.971 | 0.93 | -2.244 |
| 4.957433207364524 | 0.97 | 0.941 | -2.225 |
| 4.960574800018114 | 0.969 | 0.952 | -2.206 |
| 4.963716392671704 | 0.969 | 0.964 | -2.187 |
| 4.966857985325293 | 0.968 | 0.975 | -2.167 |
| 4.969999577978883 | 0.967 | 0.985 | -2.148 |
| 4.973141170632472 | 0.966 | 0.996 | -2.128 |
| 4.976282763286062 | 0.965 | 1.007 | -2.108 |
| 4.979424355939651 | 0.965 | 1.018 | -2.088 |
| 4.982565948593241 | 0.964 | 1.029 | -2.067 |
| 4.985707541246831 | 0.963 | 1.04 | -2.047 |
| 4.98884913390042 | 0.962 | 1.05 | -2.026 |
| 4.99199072655401 | 0.961 | 1.061 | -2.005 |
| 4.9951323192076 | 0.96 | 1.072 | -1.984 |
| 4.99827391186119 | 0.959 | 1.082 | -1.963 |
| 5.00141550451478 | 0.959 | 1.093 | -1.941 |
| 5.004557097168369 | 0.958 | 1.103 | -1.92 |
| 5.007698689821958 | 0.957 | 1.114 | -1.898 |
| 5.010840282475548 | 0.956 | 1.124 | -1.876 |
| 5.013981875129137 | 0.955 | 1.135 | -1.854 |
| 5.017123467782727 | 0.954 | 1.145 | -1.831 |
| 5.020265060436317 | 0.953 | 1.155 | -1.809 |
| 5.023406653089906 | 0.952 | 1.165 | -1.786 |
| 5.026548245743496 | 0.951 | 1.176 | -1.763 |
| 5.029689838397085 | 0.95 | 1.186 | -1.74 |
| 5.032831431050674 | 0.949 | 1.196 | -1.717 |
| 5.035973023704264 | 0.948 | 1.206 | -1.694 |
| 5.039114616357854 | 0.947 | 1.216 | -1.671 |
| 5.042256209011444 | 0.946 | 1.226 | -1.647 |
| 5.045397801665033 | 0.945 | 1.236 | -1.623 |
| 5.048539394318622 | 0.944 | 1.246 | -1.6 |
| 5.051680986972213 | 0.943 | 1.255 | -1.576 |
| 5.054822579625802 | 0.942 | 1.265 | -1.551 |
| 5.057964172279392 | 0.941 | 1.275 | -1.527 |
| 5.061105764932981 | 0.94 | 1.285 | -1.503 |
| 5.064247357586571 | 0.939 | 1.294 | -1.478 |
| 5.067388950240161 | 0.938 | 1.304 | -1.454 |
| 5.07053054289375 | 0.937 | 1.313 | -1.429 |
| 5.07367213554734 | 0.935 | 1.323 | -1.404 |
| 5.07681372820093 | 0.934 | 1.332 | -1.379 |
| 5.079955320854519 | 0.933 | 1.341 | -1.354 |
| 5.083096913508108 | 0.932 | 1.351 | -1.328 |
| 5.086238506161698 | 0.931 | 1.36 | -1.303 |
| 5.089380098815288 | 0.93 | 1.369 | -1.277 |
| 5.092521691468877 | 0.929 | 1.378 | -1.252 |
| 5.095663284122466 | 0.927 | 1.387 | -1.226 |
| 5.098804876776057 | 0.926 | 1.396 | -1.2 |
| 5.101946469429646 | 0.925 | 1.405 | -1.174 |
| 5.105088062083236 | 0.924 | 1.414 | -1.148 |
| 5.108229654736825 | 0.923 | 1.423 | -1.122 |
| 5.111371247390415 | 0.921 | 1.432 | -1.096 |
| 5.114512840044005 | 0.92 | 1.441 | -1.069 |
| 5.117654432697594 | 0.919 | 1.449 | -1.043 |
| 5.120796025351184 | 0.918 | 1.458 | -1.016 |
| 5.123937618004773 | 0.917 | 1.467 | -0.99 |
| 5.127079210658363 | 0.915 | 1.475 | -0.963 |
| 5.130220803311953 | 0.914 | 1.483 | -0.936 |
| 5.133362395965542 | 0.913 | 1.492 | -0.909 |
| 5.136503988619131 | 0.911 | 1.5 | -0.882 |
| 5.13964558127272 | 0.91 | 1.509 | -0.855 |
| 5.142787173926311 | 0.909 | 1.517 | -0.828 |
| 5.1459287665799 | 0.907 | 1.525 | -0.801 |
| 5.14907035923349 | 0.906 | 1.533 | -0.773 |
| 5.15221195188708 | 0.905 | 1.541 | -0.746 |
| 5.15535354454067 | 0.903 | 1.549 | -0.719 |
| 5.158495137194259 | 0.902 | 1.557 | -0.691 |
| 5.161636729847848 | 0.901 | 1.565 | -0.664 |
| 5.164778322501438 | 0.899 | 1.573 | -0.636 |
| 5.167919915155028 | 0.898 | 1.58 | -0.608 |
| 5.171061507808617 | 0.897 | 1.588 | -0.581 |
| 5.174203100462206 | 0.895 | 1.596 | -0.553 |
| 5.177344693115796 | 0.894 | 1.603 | -0.525 |
| 5.180486285769386 | 0.892 | 1.611 | -0.497 |
| 5.183627878422976 | 0.891 | 1.618 | -0.469 |
| 5.186769471076565 | 0.89 | 1.625 | -0.441 |
| 5.189911063730155 | 0.888 | 1.633 | -0.413 |
| 5.193052656383744 | 0.887 | 1.64 | -0.385 |
| 5.196194249037334 | 0.885 | 1.647 | -0.357 |
| 5.199335841690924 | 0.884 | 1.654 | -0.329 |
| 5.202477434344513 | 0.882 | 1.661 | -0.301 |
| 5.205619026998103 | 0.881 | 1.668 | -0.273 |
| 5.208760619651692 | 0.879 | 1.675 | -0.245 |
| 5.211902212305282 | 0.878 | 1.682 | -0.217 |
| 5.215043804958871 | 0.876 | 1.689 | -0.188 |
| 5.218185397612461 | 0.875 | 1.695 | -0.16 |
| 5.221326990266051 | 0.873 | 1.702 | -0.132 |
| 5.22446858291964 | 0.872 | 1.709 | -0.104 |
| 5.22761017557323 | 0.87 | 1.715 | -0.075 |
| 5.23075176822682 | 0.869 | 1.721 | -0.047 |
| 5.23389336088041 | 0.867 | 1.728 | -0.019 |
| 5.237034953533999 | 0.866 | 1.734 | 0.009 |
| 5.240176546187588 | 0.864 | 1.74 | 0.038 |
| 5.243318138841178 | 0.862 | 1.747 | 0.066 |
| 5.246459731494767 | 0.861 | 1.753 | 0.094 |
| 5.249601324148357 | 0.859 | 1.759 | 0.122 |
| 5.252742916801947 | 0.858 | 1.765 | 0.151 |
| 5.255884509455536 | 0.856 | 1.77 | 0.179 |
| 5.259026102109125 | 0.854 | 1.776 | 0.207 |
| 5.262167694762715 | 0.853 | 1.782 | 0.235 |
| 5.265309287416305 | 0.851 | 1.788 | 0.264 |
| 5.268450880069895 | 0.849 | 1.793 | 0.292 |
| 5.271592472723484 | 0.848 | 1.799 | 0.32 |
| 5.274734065377074 | 0.846 | 1.804 | 0.348 |
| 5.277875658030664 | 0.844 | 1.81 | 0.376 |
| 5.281017250684253 | 0.843 | 1.815 | 0.404 |
| 5.284158843337843 | 0.841 | 1.82 | 0.432 |
| 5.287300435991432 | 0.839 | 1.825 | 0.46 |
| 5.290442028645022 | 0.838 | 1.83 | 0.488 |
| 5.293583621298612 | 0.836 | 1.836 | 0.516 |
| 5.296725213952201 | 0.834 | 1.84 | 0.544 |
| 5.299866806605791 | 0.832 | 1.845 | 0.571 |
| 5.30300839925938 | 0.831 | 1.85 | 0.599 |
| 5.30614999191297 | 0.829 | 1.855 | 0.627 |
| 5.30929158456656 | 0.827 | 1.86 | 0.654 |
| 5.312433177220149 | 0.825 | 1.864 | 0.682 |
| 5.315574769873739 | 0.824 | 1.869 | 0.709 |
| 5.318716362527328 | 0.822 | 1.873 | 0.737 |
| 5.321857955180918 | 0.82 | 1.877 | 0.764 |
| 5.324999547834508 | 0.818 | 1.882 | 0.792 |
| 5.328141140488097 | 0.816 | 1.886 | 0.819 |
| 5.331282733141686 | 0.815 | 1.89 | 0.846 |
| 5.334424325795276 | 0.813 | 1.894 | 0.873 |
| 5.337565918448866 | 0.811 | 1.898 | 0.9 |
| 5.340707511102456 | 0.809 | 1.902 | 0.927 |
| 5.343849103756045 | 0.807 | 1.906 | 0.954 |
| 5.346990696409634 | 0.805 | 1.91 | 0.981 |
| 5.350132289063224 | 0.803 | 1.913 | 1.007 |
| 5.353273881716814 | 0.802 | 1.917 | 1.034 |
| 5.356415474370403 | 0.8 | 1.921 | 1.06 |
| 5.359557067023993 | 0.798 | 1.924 | 1.087 |
| 5.362698659677583 | 0.796 | 1.927 | 1.113 |
| 5.365840252331172 | 0.794 | 1.931 | 1.139 |
| 5.368981844984762 | 0.792 | 1.934 | 1.165 |
| 5.372123437638351 | 0.79 | 1.937 | 1.191 |
| 5.375265030291941 | 0.788 | 1.94 | 1.217 |
| 5.378406622945531 | 0.786 | 1.943 | 1.243 |
| 5.38154821559912 | 0.784 | 1.946 | 1.269 |
| 5.38468980825271 | 0.782 | 1.949 | 1.294 |
| 5.387831400906299 | 0.78 | 1.952 | 1.32 |
| 5.39097299355989 | 0.778 | 1.955 | 1.345 |
| 5.394114586213479 | 0.776 | 1.957 | 1.37 |
| 5.397256178867068 | 0.775 | 1.96 | 1.395 |
| 5.400397771520657 | 0.773 | 1.962 | 1.42 |
| 5.403539364174247 | 0.771 | 1.965 | 1.445 |
| 5.406680956827837 | 0.769 | 1.967 | 1.47 |
| 5.409822549481426 | 0.766 | 1.969 | 1.495 |
| 5.412964142135016 | 0.764 | 1.971 | 1.519 |
| 5.416105734788605 | 0.762 | 1.973 | 1.543 |
| 5.419247327442195 | 0.76 | 1.975 | 1.567 |
| 5.422388920095785 | 0.758 | 1.977 | 1.592 |
| 5.425530512749375 | 0.756 | 1.979 | 1.615 |
| 5.428672105402964 | 0.754 | 1.981 | 1.639 |
| 5.431813698056554 | 0.752 | 1.983 | 1.663 |
| 5.434955290710143 | 0.75 | 1.984 | 1.686 |
| 5.438096883363733 | 0.748 | 1.986 | 1.71 |
| 5.441238476017322 | 0.746 | 1.987 | 1.733 |
| 5.444380068670912 | 0.744 | 1.989 | 1.756 |
| 5.447521661324502 | 0.742 | 1.99 | 1.779 |
| 5.450663253978091 | 0.74 | 1.991 | 1.801 |
| 5.453804846631681 | 0.738 | 1.992 | 1.824 |
| 5.456946439285271 | 0.735 | 1.993 | 1.846 |
| 5.46008803193886 | 0.733 | 1.994 | 1.868 |
| 5.46322962459245 | 0.731 | 1.995 | 1.89 |
| 5.466371217246039 | 0.729 | 1.996 | 1.912 |
| 5.46951280989963 | 0.727 | 1.997 | 1.934 |
| 5.472654402553218 | 0.725 | 1.997 | 1.956 |
| 5.475795995206808 | 0.722 | 1.998 | 1.977 |
| 5.478937587860398 | 0.72 | 1.999 | 1.998 |
| 5.482079180513987 | 0.718 | 1.999 | 2.019 |
| 5.485220773167577 | 0.716 | 1.999 | 2.04 |
| 5.488362365821166 | 0.714 | 2 | 2.061 |
| 5.491503958474756 | 0.712 | 2 | 2.081 |
| 5.494645551128346 | 0.709 | 2 | 2.101 |
| 5.497787143781935 | 0.707 | 2 | 2.121 |
| 5.500928736435525 | 0.705 | 2 | 2.141 |
| 5.504070329089115 | 0.703 | 2 | 2.161 |
| 5.507211921742704 | 0.7 | 2 | 2.18 |
| 5.510353514396294 | 0.698 | 1.999 | 2.2 |
| 5.513495107049883 | 0.696 | 1.999 | 2.219 |
| 5.516636699703473 | 0.694 | 1.999 | 2.238 |
| 5.519778292357062 | 0.691 | 1.998 | 2.257 |
| 5.522919885010652 | 0.689 | 1.997 | 2.275 |
| 5.526061477664242 | 0.687 | 1.997 | 2.293 |
| 5.529203070317831 | 0.685 | 1.996 | 2.312 |
| 5.532344662971421 | 0.682 | 1.995 | 2.329 |
| 5.535486255625011 | 0.68 | 1.994 | 2.347 |
| 5.5386278482786 | 0.678 | 1.993 | 2.365 |
| 5.54176944093219 | 0.675 | 1.992 | 2.382 |
| 5.544911033585779 | 0.673 | 1.991 | 2.399 |
| 5.54805262623937 | 0.671 | 1.99 | 2.416 |
| 5.551194218892959 | 0.668 | 1.989 | 2.433 |
| 5.554335811546548 | 0.666 | 1.987 | 2.449 |
| 5.557477404200137 | 0.664 | 1.986 | 2.465 |
| 5.560618996853727 | 0.661 | 1.984 | 2.481 |
| 5.563760589507317 | 0.659 | 1.983 | 2.497 |
| 5.566902182160906 | 0.657 | 1.981 | 2.513 |
| 5.570043774814496 | 0.654 | 1.979 | 2.528 |
| 5.573185367468086 | 0.652 | 1.977 | 2.543 |
| 5.576326960121675 | 0.649 | 1.975 | 2.558 |
| 5.579468552775264 | 0.647 | 1.973 | 2.573 |
| 5.582610145428854 | 0.645 | 1.971 | 2.587 |
| 5.585751738082444 | 0.642 | 1.969 | 2.601 |
| 5.588893330736034 | 0.64 | 1.967 | 2.615 |
| 5.592034923389623 | 0.637 | 1.965 | 2.629 |
| 5.595176516043213 | 0.635 | 1.962 | 2.642 |
| 5.598318108696803 | 0.633 | 1.96 | 2.656 |
| 5.601459701350392 | 0.63 | 1.957 | 2.669 |
| 5.604601294003982 | 0.628 | 1.955 | 2.682 |
| 5.607742886657571 | 0.625 | 1.952 | 2.694 |
| 5.610884479311161 | 0.623 | 1.949 | 2.706 |
| 5.61402607196475 | 0.62 | 1.946 | 2.718 |
| 5.61716766461834 | 0.618 | 1.943 | 2.73 |
| 5.62030925727193 | 0.615 | 1.94 | 2.742 |
| 5.623450849925519 | 0.613 | 1.937 | 2.753 |
| 5.626592442579109 | 0.61 | 1.934 | 2.764 |
| 5.629734035232698 | 0.608 | 1.931 | 2.775 |
| 5.632875627886288 | 0.605 | 1.927 | 2.786 |
| 5.636017220539878 | 0.603 | 1.924 | 2.796 |
| 5.639158813193467 | 0.6 | 1.921 | 2.806 |
| 5.642300405847057 | 0.598 | 1.917 | 2.816 |
| 5.645441998500646 | 0.595 | 1.913 | 2.826 |
| 5.648583591154236 | 0.593 | 1.91 | 2.835 |
| 5.651725183807825 | 0.59 | 1.906 | 2.844 |
| 5.654866776461415 | 0.588 | 1.902 | 2.853 |
| 5.658008369115005 | 0.585 | 1.898 | 2.862 |
| 5.661149961768594 | 0.583 | 1.894 | 2.87 |
| 5.664291554422184 | 0.58 | 1.89 | 2.878 |
| 5.667433147075774 | 0.578 | 1.886 | 2.886 |
| 5.670574739729363 | 0.575 | 1.882 | 2.894 |
| 5.673716332382953 | 0.572 | 1.877 | 2.901 |
| 5.676857925036542 | 0.57 | 1.873 | 2.908 |
| 5.679999517690132 | 0.567 | 1.869 | 2.915 |
| 5.683141110343721 | 0.565 | 1.864 | 2.921 |
| 5.686282702997311 | 0.562 | 1.86 | 2.928 |
| 5.689424295650901 | 0.559 | 1.855 | 2.934 |
| 5.69256588830449 | 0.557 | 1.85 | 2.94 |
| 5.69570748095808 | 0.554 | 1.845 | 2.945 |
| 5.69884907361167 | 0.552 | 1.84 | 2.95 |
| 5.701990666265259 | 0.549 | 1.836 | 2.955 |
| 5.705132258918849 | 0.546 | 1.83 | 2.96 |
| 5.708273851572438 | 0.544 | 1.825 | 2.965 |
| 5.711415444226028 | 0.541 | 1.82 | 2.969 |
| 5.714557036879618 | 0.538 | 1.815 | 2.973 |
| 5.717698629533207 | 0.536 | 1.81 | 2.976 |
| 5.720840222186797 | 0.533 | 1.804 | 2.98 |
| 5.723981814840386 | 0.531 | 1.799 | 2.983 |
| 5.727123407493976 | 0.528 | 1.793 | 2.986 |
| 5.730265000147565 | 0.525 | 1.788 | 2.988 |
| 5.733406592801155 | 0.522 | 1.782 | 2.991 |
| 5.736548185454744 | 0.52 | 1.776 | 2.993 |
| 5.739689778108334 | 0.517 | 1.77 | 2.995 |
| 5.742831370761924 | 0.514 | 1.765 | 2.996 |
| 5.745972963415514 | 0.512 | 1.759 | 2.997 |
| 5.749114556069103 | 0.509 | 1.753 | 2.999 |
| 5.752256148722693 | 0.506 | 1.747 | 2.999 |
| 5.755397741376282 | 0.504 | 1.74 | 3 |
| 5.758539334029872 | 0.501 | 1.734 | 3 |
| 5.761680926683462 | 0.498 | 1.728 | 3 |
| 5.764822519337051 | 0.495 | 1.721 | 3 |
| 5.767964111990641 | 0.493 | 1.715 | 2.999 |
| 5.77110570464423 | 0.49 | 1.709 | 2.998 |
| 5.77424729729782 | 0.487 | 1.702 | 2.997 |
| 5.77738888995141 | 0.485 | 1.695 | 2.996 |
| 5.780530482605 | 0.482 | 1.689 | 2.994 |
| 5.783672075258588 | 0.479 | 1.682 | 2.992 |
| 5.786813667912178 | 0.476 | 1.675 | 2.99 |
| 5.789955260565768 | 0.473 | 1.668 | 2.988 |
| 5.793096853219358 | 0.471 | 1.661 | 2.985 |
| 5.796238445872947 | 0.468 | 1.654 | 2.982 |
| 5.799380038526537 | 0.465 | 1.647 | 2.979 |
| 5.802521631180126 | 0.462 | 1.64 | 2.975 |
| 5.805663223833715 | 0.46 | 1.633 | 2.971 |
| 5.808804816487306 | 0.457 | 1.625 | 2.967 |
| 5.811946409140895 | 0.454 | 1.618 | 2.963 |
| 5.815088001794485 | 0.451 | 1.611 | 2.959 |
| 5.818229594448074 | 0.448 | 1.603 | 2.954 |
| 5.821371187101663 | 0.446 | 1.596 | 2.949 |
| 5.824512779755254 | 0.443 | 1.588 | 2.943 |
| 5.827654372408843 | 0.44 | 1.58 | 2.938 |
| 5.830795965062433 | 0.437 | 1.573 | 2.932 |
| 5.833937557716022 | 0.434 | 1.565 | 2.926 |
| 5.837079150369612 | 0.431 | 1.557 | 2.919 |
| 5.840220743023201 | 0.429 | 1.549 | 2.913 |
| 5.843362335676791 | 0.426 | 1.541 | 2.906 |
| 5.846503928330381 | 0.423 | 1.533 | 2.899 |
| 5.84964552098397 | 0.42 | 1.525 | 2.891 |
| 5.85278711363756 | 0.417 | 1.517 | 2.883 |
| 5.85592870629115 | 0.414 | 1.509 | 2.876 |
| 5.85907029894474 | 0.412 | 1.5 | 2.867 |
| 5.862211891598329 | 0.409 | 1.492 | 2.859 |
| 5.865353484251918 | 0.406 | 1.483 | 2.85 |
| 5.868495076905508 | 0.403 | 1.475 | 2.841 |
| 5.871636669559098 | 0.4 | 1.467 | 2.832 |
| 5.874778262212687 | 0.397 | 1.458 | 2.823 |
| 5.877919854866277 | 0.394 | 1.449 | 2.813 |
| 5.881061447519866 | 0.391 | 1.441 | 2.803 |
| 5.884203040173456 | 0.388 | 1.432 | 2.793 |
| 5.887344632827046 | 0.386 | 1.423 | 2.782 |
| 5.890486225480635 | 0.383 | 1.414 | 2.772 |
| 5.893627818134224 | 0.38 | 1.405 | 2.761 |
| 5.896769410787814 | 0.377 | 1.396 | 2.75 |
| 5.899911003441404 | 0.374 | 1.387 | 2.738 |
| 5.903052596094994 | 0.371 | 1.378 | 2.726 |
| 5.906194188748583 | 0.368 | 1.369 | 2.714 |
| 5.909335781402172 | 0.365 | 1.36 | 2.702 |
| 5.912477374055762 | 0.362 | 1.351 | 2.69 |
| 5.915618966709352 | 0.359 | 1.341 | 2.677 |
| 5.918760559362942 | 0.356 | 1.332 | 2.664 |
| 5.921902152016531 | 0.353 | 1.323 | 2.651 |
| 5.92504374467012 | 0.351 | 1.313 | 2.638 |
| 5.92818533732371 | 0.348 | 1.304 | 2.624 |
| 5.9313269299773 | 0.345 | 1.294 | 2.611 |
| 5.93446852263089 | 0.342 | 1.285 | 2.597 |
| 5.93761011528448 | 0.339 | 1.275 | 2.582 |
| 5.940751707938068 | 0.336 | 1.265 | 2.568 |
| 5.943893300591658 | 0.333 | 1.255 | 2.553 |
| 5.947034893245248 | 0.33 | 1.246 | 2.538 |
| 5.950176485898837 | 0.327 | 1.236 | 2.523 |
| 5.953318078552427 | 0.324 | 1.226 | 2.507 |
| 5.956459671206017 | 0.321 | 1.216 | 2.492 |
| 5.959601263859606 | 0.318 | 1.206 | 2.476 |
| 5.962742856513196 | 0.315 | 1.196 | 2.46 |
| 5.965884449166785 | 0.312 | 1.186 | 2.444 |
| 5.969026041820375 | 0.309 | 1.176 | 2.427 |
| 5.972167634473964 | 0.306 | 1.165 | 2.41 |
| 5.975309227127554 | 0.303 | 1.155 | 2.393 |
| 5.978450819781144 | 0.3 | 1.145 | 2.376 |
| 5.981592412434733 | 0.297 | 1.135 | 2.359 |
| 5.984734005088323 | 0.294 | 1.124 | 2.341 |
| 5.987875597741913 | 0.291 | 1.114 | 2.324 |
| 5.991017190395502 | 0.288 | 1.103 | 2.306 |
| 5.994158783049092 | 0.285 | 1.093 | 2.287 |
| 5.997300375702681 | 0.282 | 1.082 | 2.269 |
| 6.000441968356271 | 0.279 | 1.072 | 2.25 |
| 6.003583561009861 | 0.276 | 1.061 | 2.232 |
| 6.00672515366345 | 0.273 | 1.05 | 2.213 |
| 6.00986674631704 | 0.27 | 1.04 | 2.193 |
| 6.01300833897063 | 0.267 | 1.029 | 2.174 |
| 6.01614993162422 | 0.264 | 1.018 | 2.154 |
| 6.019291524277808 | 0.261 | 1.007 | 2.135 |
| 6.022433116931398 | 0.258 | 0.996 | 2.115 |
| 6.025574709584988 | 0.255 | 0.985 | 2.094 |
| 6.028716302238577 | 0.252 | 0.975 | 2.074 |
| 6.031857894892167 | 0.249 | 0.964 | 2.054 |
| 6.034999487545757 | 0.246 | 0.952 | 2.033 |
| 6.038141080199346 | 0.243 | 0.941 | 2.012 |
| 6.041282672852935 | 0.24 | 0.93 | 1.991 |
| 6.044424265506525 | 0.236 | 0.919 | 1.97 |
| 6.047565858160115 | 0.233 | 0.908 | 1.948 |
| 6.050707450813704 | 0.23 | 0.897 | 1.927 |
| 6.053849043467294 | 0.227 | 0.886 | 1.905 |
| 6.056990636120884 | 0.224 | 0.874 | 1.883 |
| 6.060132228774473 | 0.221 | 0.863 | 1.861 |
| 6.063273821428063 | 0.218 | 0.852 | 1.839 |
| 6.066415414081653 | 0.215 | 0.84 | 1.816 |
| 6.069557006735242 | 0.212 | 0.829 | 1.794 |
| 6.072698599388831 | 0.209 | 0.817 | 1.771 |
| 6.07584019204242 | 0.206 | 0.806 | 1.748 |
| 6.078981784696011 | 0.203 | 0.794 | 1.725 |
| 6.082123377349601 | 0.2 | 0.783 | 1.702 |
| 6.08526497000319 | 0.197 | 0.771 | 1.678 |
| 6.08840656265678 | 0.194 | 0.76 | 1.655 |
| 6.09154815531037 | 0.19 | 0.748 | 1.631 |
| 6.094689747963959 | 0.187 | 0.736 | 1.607 |
| 6.097831340617549 | 0.184 | 0.725 | 1.584 |
| 6.100972933271138 | 0.181 | 0.713 | 1.559 |
| 6.104114525924728 | 0.178 | 0.701 | 1.535 |
| 6.107256118578317 | 0.175 | 0.689 | 1.511 |
| 6.110397711231907 | 0.172 | 0.677 | 1.486 |
| 6.113539303885497 | 0.169 | 0.666 | 1.462 |
| 6.116680896539086 | 0.166 | 0.654 | 1.437 |
| 6.119822489192675 | 0.163 | 0.642 | 1.412 |
| 6.122964081846265 | 0.16 | 0.63 | 1.387 |
| 6.126105674499855 | 0.156 | 0.618 | 1.362 |
| 6.129247267153445 | 0.153 | 0.606 | 1.337 |
| 6.132388859807034 | 0.15 | 0.594 | 1.311 |
| 6.135530452460624 | 0.147 | 0.582 | 1.286 |
| 6.138672045114213 | 0.144 | 0.57 | 1.26 |
| 6.141813637767803 | 0.141 | 0.558 | 1.235 |
| 6.144955230421393 | 0.138 | 0.546 | 1.209 |
| 6.148096823074982 | 0.135 | 0.534 | 1.183 |
| 6.151238415728571 | 0.132 | 0.522 | 1.157 |
| 6.154380008382161 | 0.128 | 0.51 | 1.131 |
| 6.157521601035751 | 0.125 | 0.497 | 1.104 |
| 6.16066319368934 | 0.122 | 0.485 | 1.078 |
| 6.16380478634293 | 0.119 | 0.473 | 1.052 |
| 6.16694637899652 | 0.116 | 0.461 | 1.025 |
| 6.170087971650109 | 0.113 | 0.449 | 0.998 |
| 6.173229564303698 | 0.11 | 0.436 | 0.972 |
| 6.176371156957289 | 0.107 | 0.424 | 0.945 |
| 6.179512749610878 | 0.103 | 0.412 | 0.918 |
| 6.182654342264468 | 0.1 | 0.399 | 0.891 |
| 6.185795934918057 | 0.097 | 0.387 | 0.864 |
| 6.188937527571647 | 0.094 | 0.375 | 0.837 |
| 6.192079120225237 | 0.091 | 0.362 | 0.81 |
| 6.195220712878826 | 0.088 | 0.35 | 0.783 |
| 6.198362305532415 | 0.085 | 0.338 | 0.755 |
| 6.201503898186005 | 0.082 | 0.325 | 0.728 |
| 6.204645490839594 | 0.078 | 0.313 | 0.7 |
| 6.207787083493184 | 0.075 | 0.3 | 0.673 |
| 6.210928676146774 | 0.072 | 0.288 | 0.645 |
| 6.214070268800364 | 0.069 | 0.276 | 0.618 |
| 6.217211861453953 | 0.066 | 0.263 | 0.59 |
| 6.220353454107543 | 0.063 | 0.251 | 0.562 |
| 6.223495046761133 | 0.06 | 0.238 | 0.534 |
| 6.226636639414722 | 0.057 | 0.226 | 0.507 |
| 6.229778232068312 | 0.053 | 0.213 | 0.479 |
| 6.232919824721901 | 0.05 | 0.201 | 0.451 |
| 6.236061417375491 | 0.047 | 0.188 | 0.423 |
| 6.23920301002908 | 0.044 | 0.176 | 0.395 |
| 6.24234460268267 | 0.041 | 0.163 | 0.367 |
| 6.24548619533626 | 0.038 | 0.151 | 0.339 |
| 6.24862778798985 | 0.035 | 0.138 | 0.31 |
| 6.251769380643438 | 0.031 | 0.126 | 0.282 |
| 6.254910973297028 | 0.028 | 0.113 | 0.254 |
| 6.258052565950618 | 0.025 | 0.1 | 0.226 |
| 6.261194158604208 | 0.022 | 0.088 | 0.198 |
| 6.264335751257797 | 0.019 | 0.075 | 0.17 |
| 6.267477343911387 | 0.016 | 0.063 | 0.141 |
| 6.270618936564976 | 0.013 | 0.05 | 0.113 |
| 6.273760529218566 | 0.009 | 0.038 | 0.085 |
| 6.276902121872155 | 0.006 | 0.025 | 0.057 |
| 6.280043714525745 | 0.003 | 0.013 | 0.028 |
| 6.283185307179335 | 0 | 0 | 0 |